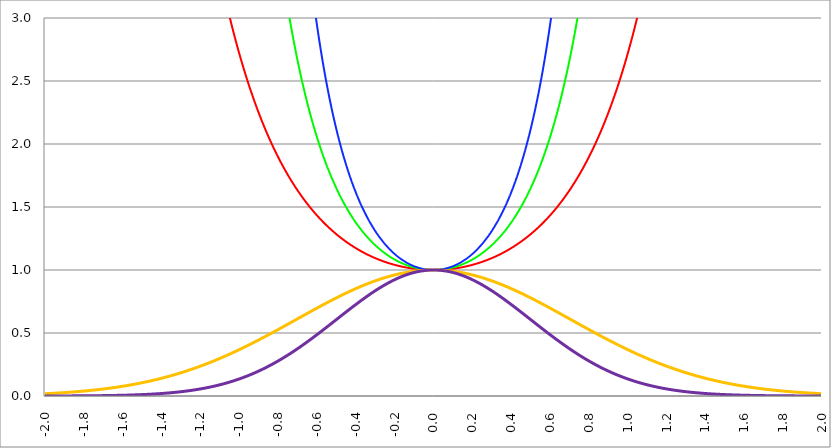
| Category | Series 1 | Series 0 | Series 2 | Series 3 | Series 4 |
|---|---|---|---|---|---|
| -2.0 | 54.598 | 2980.958 | 162754.791 | 0.018 | 0 |
| -1.998 | 54.163 | 2933.666 | 158897.084 | 0.018 | 0 |
| -1.996 | 53.732 | 2887.17 | 155134.537 | 0.019 | 0 |
| -1.994 | 53.305 | 2841.456 | 151464.719 | 0.019 | 0 |
| -1.992 | 52.882 | 2796.511 | 147885.263 | 0.019 | 0 |
| -1.99 | 52.463 | 2752.321 | 144393.862 | 0.019 | 0 |
| -1.988 | 52.047 | 2708.873 | 140988.274 | 0.019 | 0 |
| -1.986 | 51.635 | 2666.153 | 137666.311 | 0.019 | 0 |
| -1.984 | 51.226 | 2624.149 | 134425.847 | 0.02 | 0 |
| -1.982 | 50.822 | 2582.848 | 131264.808 | 0.02 | 0 |
| -1.98 | 50.421 | 2542.238 | 128181.179 | 0.02 | 0 |
| -1.978 | 50.023 | 2502.306 | 125172.993 | 0.02 | 0 |
| -1.976 | 49.629 | 2463.041 | 122238.337 | 0.02 | 0 |
| -1.974 | 49.239 | 2424.431 | 119375.349 | 0.02 | 0 |
| -1.972 | 48.851 | 2386.464 | 116582.214 | 0.02 | 0 |
| -1.97 | 48.468 | 2349.129 | 113857.165 | 0.021 | 0 |
| -1.968 | 48.088 | 2312.416 | 111198.481 | 0.021 | 0 |
| -1.966 | 47.711 | 2276.312 | 108604.487 | 0.021 | 0 |
| -1.964 | 47.337 | 2240.808 | 106073.55 | 0.021 | 0 |
| -1.962 | 46.967 | 2205.894 | 103604.081 | 0.021 | 0 |
| -1.96 | 46.6 | 2171.558 | 101194.532 | 0.021 | 0 |
| -1.958 | 46.236 | 2137.79 | 98843.394 | 0.022 | 0 |
| -1.956 | 45.876 | 2104.582 | 96549.2 | 0.022 | 0 |
| -1.954 | 45.518 | 2071.922 | 94310.518 | 0.022 | 0 |
| -1.952 | 45.164 | 2039.802 | 92125.955 | 0.022 | 0 |
| -1.95 | 44.813 | 2008.212 | 89994.155 | 0.022 | 0 |
| -1.948 | 44.465 | 1977.143 | 87913.794 | 0.022 | 0.001 |
| -1.946 | 44.12 | 1946.585 | 85883.585 | 0.023 | 0.001 |
| -1.944 | 43.778 | 1916.531 | 83902.274 | 0.023 | 0.001 |
| -1.942 | 43.439 | 1886.971 | 81968.639 | 0.023 | 0.001 |
| -1.94 | 43.103 | 1857.896 | 80081.488 | 0.023 | 0.001 |
| -1.938 | 42.77 | 1829.299 | 78239.663 | 0.023 | 0.001 |
| -1.936 | 42.44 | 1801.17 | 76442.033 | 0.024 | 0.001 |
| -1.934 | 42.113 | 1773.503 | 74687.498 | 0.024 | 0.001 |
| -1.932 | 41.789 | 1746.289 | 72974.986 | 0.024 | 0.001 |
| -1.93 | 41.467 | 1719.519 | 71303.451 | 0.024 | 0.001 |
| -1.928 | 41.148 | 1693.187 | 69671.875 | 0.024 | 0.001 |
| -1.926 | 40.832 | 1667.285 | 68079.267 | 0.024 | 0.001 |
| -1.924 | 40.519 | 1641.806 | 66524.661 | 0.025 | 0.001 |
| -1.922 | 40.209 | 1616.742 | 65007.115 | 0.025 | 0.001 |
| -1.92 | 39.901 | 1592.085 | 63525.711 | 0.025 | 0.001 |
| -1.918 | 39.596 | 1567.83 | 62079.556 | 0.025 | 0.001 |
| -1.916 | 39.293 | 1543.97 | 60667.778 | 0.025 | 0.001 |
| -1.914 | 38.994 | 1520.496 | 59289.529 | 0.026 | 0.001 |
| -1.912 | 38.696 | 1497.404 | 57943.982 | 0.026 | 0.001 |
| -1.91 | 38.402 | 1474.685 | 56630.331 | 0.026 | 0.001 |
| -1.908 | 38.11 | 1452.335 | 55347.789 | 0.026 | 0.001 |
| -1.906 | 37.82 | 1430.346 | 54095.593 | 0.026 | 0.001 |
| -1.904 | 37.533 | 1408.713 | 52872.995 | 0.027 | 0.001 |
| -1.902 | 37.248 | 1387.429 | 51679.269 | 0.027 | 0.001 |
| -1.9 | 36.966 | 1366.489 | 50513.707 | 0.027 | 0.001 |
| -1.898 | 36.686 | 1345.886 | 49375.617 | 0.027 | 0.001 |
| -1.896 | 36.409 | 1325.615 | 48264.327 | 0.027 | 0.001 |
| -1.894 | 36.134 | 1305.671 | 47179.181 | 0.028 | 0.001 |
| -1.892 | 35.861 | 1286.046 | 46119.54 | 0.028 | 0.001 |
| -1.89 | 35.591 | 1266.738 | 45084.78 | 0.028 | 0.001 |
| -1.888 | 35.323 | 1247.739 | 44074.294 | 0.028 | 0.001 |
| -1.886 | 35.058 | 1229.044 | 43087.491 | 0.029 | 0.001 |
| -1.884 | 34.794 | 1210.649 | 42123.792 | 0.029 | 0.001 |
| -1.882 | 34.533 | 1192.549 | 41182.636 | 0.029 | 0.001 |
| -1.88 | 34.274 | 1174.738 | 40263.475 | 0.029 | 0.001 |
| -1.878 | 34.018 | 1157.211 | 39365.773 | 0.029 | 0.001 |
| -1.876 | 33.763 | 1139.964 | 38489.009 | 0.03 | 0.001 |
| -1.874 | 33.511 | 1122.992 | 37632.676 | 0.03 | 0.001 |
| -1.872 | 33.261 | 1106.291 | 36796.279 | 0.03 | 0.001 |
| -1.87 | 33.013 | 1089.855 | 35979.334 | 0.03 | 0.001 |
| -1.868 | 32.767 | 1073.681 | 35181.371 | 0.031 | 0.001 |
| -1.866 | 32.523 | 1057.763 | 34401.932 | 0.031 | 0.001 |
| -1.864 | 32.282 | 1042.099 | 33640.568 | 0.031 | 0.001 |
| -1.862 | 32.042 | 1026.682 | 32896.844 | 0.031 | 0.001 |
| -1.86 | 31.804 | 1011.51 | 32170.334 | 0.031 | 0.001 |
| -1.858 | 31.569 | 996.579 | 31460.624 | 0.032 | 0.001 |
| -1.856 | 31.335 | 981.883 | 30767.309 | 0.032 | 0.001 |
| -1.854 | 31.103 | 967.419 | 30089.995 | 0.032 | 0.001 |
| -1.852 | 30.874 | 953.184 | 29428.298 | 0.032 | 0.001 |
| -1.85 | 30.646 | 939.173 | 28781.843 | 0.033 | 0.001 |
| -1.848 | 30.42 | 925.383 | 28150.264 | 0.033 | 0.001 |
| -1.846 | 30.196 | 911.81 | 27533.205 | 0.033 | 0.001 |
| -1.844 | 29.974 | 898.451 | 26930.318 | 0.033 | 0.001 |
| -1.842 | 29.754 | 885.301 | 26341.265 | 0.034 | 0.001 |
| -1.84 | 29.536 | 872.358 | 25765.715 | 0.034 | 0.001 |
| -1.838 | 29.319 | 859.618 | 25203.345 | 0.034 | 0.001 |
| -1.836 | 29.105 | 847.077 | 24653.841 | 0.034 | 0.001 |
| -1.834 | 28.892 | 834.733 | 24116.897 | 0.035 | 0.001 |
| -1.832 | 28.681 | 822.582 | 23592.213 | 0.035 | 0.001 |
| -1.83 | 28.471 | 810.62 | 23079.499 | 0.035 | 0.001 |
| -1.828 | 28.264 | 798.846 | 22578.468 | 0.035 | 0.001 |
| -1.826 | 28.058 | 787.255 | 22088.845 | 0.036 | 0.001 |
| -1.824 | 27.854 | 775.844 | 21610.358 | 0.036 | 0.001 |
| -1.822 | 27.652 | 764.612 | 21142.743 | 0.036 | 0.001 |
| -1.82 | 27.451 | 753.553 | 20685.743 | 0.036 | 0.001 |
| -1.818 | 27.252 | 742.667 | 20239.107 | 0.037 | 0.001 |
| -1.816 | 27.055 | 731.95 | 19802.59 | 0.037 | 0.001 |
| -1.814 | 26.859 | 721.399 | 19375.952 | 0.037 | 0.001 |
| -1.812 | 26.665 | 711.011 | 18958.961 | 0.038 | 0.001 |
| -1.81 | 26.472 | 700.784 | 18551.39 | 0.038 | 0.001 |
| -1.808 | 26.281 | 690.715 | 18153.016 | 0.038 | 0.001 |
| -1.806 | 26.092 | 680.802 | 17763.623 | 0.038 | 0.001 |
| -1.804 | 25.904 | 671.042 | 17383 | 0.039 | 0.001 |
| -1.802 | 25.718 | 661.433 | 17010.941 | 0.039 | 0.002 |
| -1.8 | 25.534 | 651.971 | 16647.245 | 0.039 | 0.002 |
| -1.798 | 25.351 | 642.655 | 16291.715 | 0.039 | 0.002 |
| -1.796 | 25.169 | 633.482 | 15944.162 | 0.04 | 0.002 |
| -1.794 | 24.989 | 624.45 | 15604.397 | 0.04 | 0.002 |
| -1.792 | 24.81 | 615.557 | 15272.239 | 0.04 | 0.002 |
| -1.79 | 24.633 | 606.8 | 14947.51 | 0.041 | 0.002 |
| -1.788 | 24.458 | 598.178 | 14630.037 | 0.041 | 0.002 |
| -1.786 | 24.283 | 589.687 | 14319.65 | 0.041 | 0.002 |
| -1.784 | 24.111 | 581.326 | 14016.185 | 0.041 | 0.002 |
| -1.782 | 23.939 | 573.093 | 13719.48 | 0.042 | 0.002 |
| -1.78 | 23.769 | 564.985 | 13429.378 | 0.042 | 0.002 |
| -1.778 | 23.601 | 557.002 | 13145.726 | 0.042 | 0.002 |
| -1.776 | 23.434 | 549.139 | 12868.375 | 0.043 | 0.002 |
| -1.774 | 23.268 | 541.397 | 12597.177 | 0.043 | 0.002 |
| -1.772 | 23.103 | 533.772 | 12331.99 | 0.043 | 0.002 |
| -1.77 | 22.94 | 526.262 | 12072.676 | 0.044 | 0.002 |
| -1.768 | 22.779 | 518.867 | 11819.098 | 0.044 | 0.002 |
| -1.766 | 22.618 | 511.584 | 11571.124 | 0.044 | 0.002 |
| -1.764 | 22.459 | 504.411 | 11328.625 | 0.045 | 0.002 |
| -1.762 | 22.301 | 497.347 | 11091.474 | 0.045 | 0.002 |
| -1.76 | 22.145 | 490.39 | 10859.548 | 0.045 | 0.002 |
| -1.758 | 21.989 | 483.537 | 10632.727 | 0.045 | 0.002 |
| -1.756 | 21.835 | 476.788 | 10410.894 | 0.046 | 0.002 |
| -1.754 | 21.683 | 470.141 | 10193.933 | 0.046 | 0.002 |
| -1.752 | 21.531 | 463.593 | 9981.733 | 0.046 | 0.002 |
| -1.75 | 21.381 | 457.145 | 9774.185 | 0.047 | 0.002 |
| -1.748 | 21.232 | 450.793 | 9571.182 | 0.047 | 0.002 |
| -1.746 | 21.084 | 444.536 | 9372.62 | 0.047 | 0.002 |
| -1.744 | 20.937 | 438.374 | 9178.398 | 0.048 | 0.002 |
| -1.742 | 20.792 | 432.304 | 8988.417 | 0.048 | 0.002 |
| -1.74 | 20.648 | 426.324 | 8802.579 | 0.048 | 0.002 |
| -1.738 | 20.504 | 420.434 | 8620.79 | 0.049 | 0.002 |
| -1.736 | 20.363 | 414.632 | 8442.958 | 0.049 | 0.002 |
| -1.734 | 20.222 | 408.917 | 8268.993 | 0.049 | 0.002 |
| -1.732 | 20.082 | 403.287 | 8098.807 | 0.05 | 0.002 |
| -1.73 | 19.943 | 397.741 | 7932.313 | 0.05 | 0.003 |
| -1.728 | 19.806 | 392.277 | 7769.429 | 0.05 | 0.003 |
| -1.726 | 19.67 | 386.894 | 7610.073 | 0.051 | 0.003 |
| -1.724 | 19.534 | 381.592 | 7454.163 | 0.051 | 0.003 |
| -1.722 | 19.4 | 376.368 | 7301.624 | 0.052 | 0.003 |
| -1.72 | 19.267 | 371.222 | 7152.377 | 0.052 | 0.003 |
| -1.718 | 19.135 | 366.152 | 7006.349 | 0.052 | 0.003 |
| -1.716 | 19.004 | 361.157 | 6863.467 | 0.053 | 0.003 |
| -1.714 | 18.874 | 356.235 | 6723.66 | 0.053 | 0.003 |
| -1.712 | 18.745 | 351.387 | 6586.86 | 0.053 | 0.003 |
| -1.71 | 18.617 | 346.61 | 6452.997 | 0.054 | 0.003 |
| -1.708 | 18.491 | 341.903 | 6322.007 | 0.054 | 0.003 |
| -1.706 | 18.365 | 337.266 | 6193.824 | 0.054 | 0.003 |
| -1.704 | 18.24 | 332.697 | 6068.386 | 0.055 | 0.003 |
| -1.702 | 18.116 | 328.195 | 5945.631 | 0.055 | 0.003 |
| -1.7 | 17.993 | 323.759 | 5825.499 | 0.056 | 0.003 |
| -1.698 | 17.871 | 319.388 | 5707.932 | 0.056 | 0.003 |
| -1.696 | 17.751 | 315.082 | 5592.871 | 0.056 | 0.003 |
| -1.694 | 17.631 | 310.838 | 5480.261 | 0.057 | 0.003 |
| -1.692 | 17.512 | 306.656 | 5370.047 | 0.057 | 0.003 |
| -1.69 | 17.394 | 302.536 | 5262.176 | 0.057 | 0.003 |
| -1.688 | 17.276 | 298.476 | 5156.596 | 0.058 | 0.003 |
| -1.686 | 17.16 | 294.474 | 5053.256 | 0.058 | 0.003 |
| -1.684 | 17.045 | 290.531 | 4952.105 | 0.059 | 0.003 |
| -1.682 | 16.931 | 286.646 | 4853.095 | 0.059 | 0.003 |
| -1.68 | 16.817 | 282.817 | 4756.18 | 0.059 | 0.004 |
| -1.678 | 16.705 | 279.044 | 4661.311 | 0.06 | 0.004 |
| -1.676 | 16.593 | 275.325 | 4568.444 | 0.06 | 0.004 |
| -1.674 | 16.482 | 271.66 | 4477.535 | 0.061 | 0.004 |
| -1.672 | 16.372 | 268.049 | 4388.541 | 0.061 | 0.004 |
| -1.67 | 16.263 | 264.489 | 4301.418 | 0.061 | 0.004 |
| -1.668 | 16.155 | 260.981 | 4216.126 | 0.062 | 0.004 |
| -1.666 | 16.048 | 257.524 | 4132.625 | 0.062 | 0.004 |
| -1.664 | 15.941 | 254.116 | 4050.874 | 0.063 | 0.004 |
| -1.662 | 15.835 | 250.758 | 3970.836 | 0.063 | 0.004 |
| -1.66 | 15.73 | 247.448 | 3892.473 | 0.064 | 0.004 |
| -1.658 | 15.626 | 244.185 | 3815.748 | 0.064 | 0.004 |
| -1.656 | 15.523 | 240.97 | 3740.625 | 0.064 | 0.004 |
| -1.654 | 15.421 | 237.8 | 3667.069 | 0.065 | 0.004 |
| -1.652 | 15.319 | 234.677 | 3595.046 | 0.065 | 0.004 |
| -1.65 | 15.218 | 231.597 | 3524.522 | 0.066 | 0.004 |
| -1.648 | 15.118 | 228.562 | 3455.464 | 0.066 | 0.004 |
| -1.646 | 15.019 | 225.57 | 3387.841 | 0.067 | 0.004 |
| -1.644 | 14.92 | 222.621 | 3321.62 | 0.067 | 0.004 |
| -1.642 | 14.823 | 219.714 | 3256.773 | 0.067 | 0.005 |
| -1.64 | 14.726 | 216.849 | 3193.268 | 0.068 | 0.005 |
| -1.638 | 14.63 | 214.024 | 3131.076 | 0.068 | 0.005 |
| -1.636 | 14.534 | 211.239 | 3070.169 | 0.069 | 0.005 |
| -1.634 | 14.439 | 208.494 | 3010.52 | 0.069 | 0.005 |
| -1.632 | 14.345 | 205.788 | 2952.1 | 0.07 | 0.005 |
| -1.63 | 14.252 | 203.121 | 2894.883 | 0.07 | 0.005 |
| -1.628 | 14.159 | 200.491 | 2838.843 | 0.071 | 0.005 |
| -1.626 | 14.068 | 197.898 | 2783.955 | 0.071 | 0.005 |
| -1.624 | 13.976 | 195.342 | 2730.194 | 0.072 | 0.005 |
| -1.622 | 13.886 | 192.822 | 2677.535 | 0.072 | 0.005 |
| -1.62 | 13.796 | 190.338 | 2625.955 | 0.072 | 0.005 |
| -1.618 | 13.707 | 187.888 | 2575.431 | 0.073 | 0.005 |
| -1.616 | 13.619 | 185.473 | 2525.939 | 0.073 | 0.005 |
| -1.614 | 13.531 | 183.093 | 2477.457 | 0.074 | 0.005 |
| -1.612 | 13.444 | 180.745 | 2429.965 | 0.074 | 0.006 |
| -1.61 | 13.358 | 178.431 | 2383.44 | 0.075 | 0.006 |
| -1.608 | 13.272 | 176.149 | 2337.862 | 0.075 | 0.006 |
| -1.606 | 13.187 | 173.899 | 2293.21 | 0.076 | 0.006 |
| -1.604 | 13.103 | 171.68 | 2249.466 | 0.076 | 0.006 |
| -1.602 | 13.019 | 169.492 | 2206.608 | 0.077 | 0.006 |
| -1.6 | 12.936 | 167.335 | 2164.62 | 0.077 | 0.006 |
| -1.598 | 12.853 | 165.208 | 2123.481 | 0.078 | 0.006 |
| -1.596 | 12.771 | 163.111 | 2083.174 | 0.078 | 0.006 |
| -1.594 | 12.69 | 161.043 | 2043.681 | 0.079 | 0.006 |
| -1.592 | 12.61 | 159.004 | 2004.985 | 0.079 | 0.006 |
| -1.59 | 12.53 | 156.993 | 1967.069 | 0.08 | 0.006 |
| -1.588 | 12.45 | 155.01 | 1929.916 | 0.08 | 0.006 |
| -1.586 | 12.372 | 153.054 | 1893.511 | 0.081 | 0.007 |
| -1.584 | 12.293 | 151.126 | 1857.837 | 0.081 | 0.007 |
| -1.582 | 12.216 | 149.224 | 1822.878 | 0.082 | 0.007 |
| -1.58 | 12.139 | 147.348 | 1788.621 | 0.082 | 0.007 |
| -1.578 | 12.062 | 145.499 | 1755.049 | 0.083 | 0.007 |
| -1.576 | 11.986 | 143.675 | 1722.149 | 0.083 | 0.007 |
| -1.574 | 11.911 | 141.876 | 1689.906 | 0.084 | 0.007 |
| -1.572 | 11.836 | 140.102 | 1658.306 | 0.084 | 0.007 |
| -1.57 | 11.762 | 138.352 | 1627.337 | 0.085 | 0.007 |
| -1.568 | 11.689 | 136.626 | 1596.984 | 0.086 | 0.007 |
| -1.566 | 11.616 | 134.924 | 1567.235 | 0.086 | 0.007 |
| -1.564 | 11.543 | 133.245 | 1538.077 | 0.087 | 0.008 |
| -1.562 | 11.471 | 131.59 | 1509.497 | 0.087 | 0.008 |
| -1.56 | 11.4 | 129.957 | 1481.485 | 0.088 | 0.008 |
| -1.558 | 11.329 | 128.346 | 1454.027 | 0.088 | 0.008 |
| -1.556 | 11.259 | 126.757 | 1427.112 | 0.089 | 0.008 |
| -1.554 | 11.189 | 125.19 | 1400.729 | 0.089 | 0.008 |
| -1.552 | 11.12 | 123.644 | 1374.867 | 0.09 | 0.008 |
| -1.55 | 11.051 | 122.119 | 1349.514 | 0.09 | 0.008 |
| -1.548 | 10.983 | 120.616 | 1324.661 | 0.091 | 0.008 |
| -1.546 | 10.915 | 119.132 | 1300.297 | 0.092 | 0.008 |
| -1.544 | 10.848 | 117.669 | 1276.412 | 0.092 | 0.008 |
| -1.542 | 10.781 | 116.225 | 1252.995 | 0.093 | 0.009 |
| -1.54 | 10.715 | 114.801 | 1230.038 | 0.093 | 0.009 |
| -1.538 | 10.649 | 113.396 | 1207.53 | 0.094 | 0.009 |
| -1.536 | 10.583 | 112.01 | 1185.462 | 0.094 | 0.009 |
| -1.534 | 10.519 | 110.643 | 1163.826 | 0.095 | 0.009 |
| -1.532 | 10.454 | 109.295 | 1142.612 | 0.096 | 0.009 |
| -1.53 | 10.391 | 107.964 | 1121.811 | 0.096 | 0.009 |
| -1.528 | 10.327 | 106.652 | 1101.416 | 0.097 | 0.009 |
| -1.526 | 10.264 | 105.357 | 1081.418 | 0.097 | 0.009 |
| -1.524 | 10.202 | 104.079 | 1061.808 | 0.098 | 0.01 |
| -1.522 | 10.14 | 102.819 | 1042.578 | 0.099 | 0.01 |
| -1.52 | 10.078 | 101.575 | 1023.722 | 0.099 | 0.01 |
| -1.518 | 10.017 | 100.348 | 1005.23 | 0.1 | 0.01 |
| -1.516 | 9.957 | 99.138 | 987.097 | 0.1 | 0.01 |
| -1.514 | 9.897 | 97.944 | 969.313 | 0.101 | 0.01 |
| -1.512 | 9.837 | 96.765 | 951.873 | 0.102 | 0.01 |
| -1.51 | 9.778 | 95.603 | 934.77 | 0.102 | 0.01 |
| -1.508 | 9.719 | 94.455 | 917.995 | 0.103 | 0.011 |
| -1.506 | 9.66 | 93.324 | 901.543 | 0.104 | 0.011 |
| -1.504 | 9.602 | 92.207 | 885.408 | 0.104 | 0.011 |
| -1.502 | 9.545 | 91.105 | 869.581 | 0.105 | 0.011 |
| -1.5 | 9.488 | 90.017 | 854.059 | 0.105 | 0.011 |
| -1.498 | 9.431 | 88.944 | 838.833 | 0.106 | 0.011 |
| -1.496 | 9.375 | 87.885 | 823.899 | 0.107 | 0.011 |
| -1.494 | 9.319 | 86.84 | 809.25 | 0.107 | 0.012 |
| -1.492 | 9.263 | 85.809 | 794.881 | 0.108 | 0.012 |
| -1.49 | 9.208 | 84.792 | 780.785 | 0.109 | 0.012 |
| -1.488 | 9.154 | 83.788 | 766.958 | 0.109 | 0.012 |
| -1.486 | 9.099 | 82.797 | 753.394 | 0.11 | 0.012 |
| -1.484 | 9.045 | 81.819 | 740.087 | 0.111 | 0.012 |
| -1.482 | 8.992 | 80.854 | 727.033 | 0.111 | 0.012 |
| -1.48 | 8.939 | 79.902 | 714.226 | 0.112 | 0.013 |
| -1.478 | 8.886 | 78.962 | 701.662 | 0.113 | 0.013 |
| -1.476 | 8.834 | 78.035 | 689.335 | 0.113 | 0.013 |
| -1.474 | 8.782 | 77.119 | 677.242 | 0.114 | 0.013 |
| -1.472 | 8.73 | 76.216 | 665.376 | 0.115 | 0.013 |
| -1.469999999999999 | 8.679 | 75.324 | 653.734 | 0.115 | 0.013 |
| -1.467999999999999 | 8.628 | 74.444 | 642.311 | 0.116 | 0.013 |
| -1.465999999999999 | 8.578 | 73.575 | 631.102 | 0.117 | 0.014 |
| -1.463999999999999 | 8.527 | 72.718 | 620.104 | 0.117 | 0.014 |
| -1.461999999999999 | 8.478 | 71.872 | 609.313 | 0.118 | 0.014 |
| -1.459999999999999 | 8.428 | 71.037 | 598.724 | 0.119 | 0.014 |
| -1.457999999999999 | 8.379 | 70.213 | 588.332 | 0.119 | 0.014 |
| -1.455999999999999 | 8.331 | 69.399 | 578.135 | 0.12 | 0.014 |
| -1.453999999999999 | 8.282 | 68.596 | 568.129 | 0.121 | 0.015 |
| -1.451999999999999 | 8.234 | 67.803 | 558.309 | 0.121 | 0.015 |
| -1.449999999999999 | 8.187 | 67.021 | 548.672 | 0.122 | 0.015 |
| -1.447999999999999 | 8.139 | 66.248 | 539.214 | 0.123 | 0.015 |
| -1.445999999999999 | 8.092 | 65.486 | 529.932 | 0.124 | 0.015 |
| -1.443999999999999 | 8.046 | 64.733 | 520.822 | 0.124 | 0.015 |
| -1.441999999999999 | 7.999 | 63.99 | 511.881 | 0.125 | 0.016 |
| -1.439999999999999 | 7.953 | 63.257 | 503.106 | 0.126 | 0.016 |
| -1.437999999999999 | 7.908 | 62.533 | 494.493 | 0.126 | 0.016 |
| -1.435999999999999 | 7.862 | 61.818 | 486.039 | 0.127 | 0.016 |
| -1.433999999999999 | 7.817 | 61.112 | 477.741 | 0.128 | 0.016 |
| -1.431999999999999 | 7.773 | 60.416 | 469.596 | 0.129 | 0.017 |
| -1.429999999999999 | 7.728 | 59.728 | 461.601 | 0.129 | 0.017 |
| -1.427999999999999 | 7.684 | 59.049 | 453.753 | 0.13 | 0.017 |
| -1.425999999999999 | 7.641 | 58.379 | 446.049 | 0.131 | 0.017 |
| -1.423999999999999 | 7.597 | 57.717 | 438.486 | 0.132 | 0.017 |
| -1.421999999999999 | 7.554 | 57.064 | 431.062 | 0.132 | 0.018 |
| -1.419999999999999 | 7.511 | 56.419 | 423.774 | 0.133 | 0.018 |
| -1.417999999999999 | 7.469 | 55.782 | 416.619 | 0.134 | 0.018 |
| -1.415999999999999 | 7.427 | 55.153 | 409.595 | 0.135 | 0.018 |
| -1.413999999999999 | 7.385 | 54.532 | 402.698 | 0.135 | 0.018 |
| -1.411999999999999 | 7.343 | 53.919 | 395.928 | 0.136 | 0.019 |
| -1.409999999999999 | 7.302 | 53.314 | 389.28 | 0.137 | 0.019 |
| -1.407999999999999 | 7.261 | 52.716 | 382.754 | 0.138 | 0.019 |
| -1.405999999999999 | 7.22 | 52.126 | 376.346 | 0.139 | 0.019 |
| -1.403999999999999 | 7.179 | 51.544 | 370.054 | 0.139 | 0.019 |
| -1.401999999999999 | 7.139 | 50.969 | 363.876 | 0.14 | 0.02 |
| -1.399999999999999 | 7.099 | 50.4 | 357.809 | 0.141 | 0.02 |
| -1.397999999999999 | 7.06 | 49.84 | 351.852 | 0.142 | 0.02 |
| -1.395999999999999 | 7.02 | 49.286 | 346.003 | 0.142 | 0.02 |
| -1.393999999999999 | 6.981 | 48.739 | 340.259 | 0.143 | 0.021 |
| -1.391999999999999 | 6.943 | 48.199 | 334.619 | 0.144 | 0.021 |
| -1.389999999999999 | 6.904 | 47.665 | 329.08 | 0.145 | 0.021 |
| -1.387999999999999 | 6.866 | 47.138 | 323.64 | 0.146 | 0.021 |
| -1.385999999999999 | 6.828 | 46.618 | 318.298 | 0.146 | 0.021 |
| -1.383999999999999 | 6.79 | 46.105 | 313.052 | 0.147 | 0.022 |
| -1.381999999999999 | 6.753 | 45.597 | 307.899 | 0.148 | 0.022 |
| -1.379999999999999 | 6.715 | 45.096 | 302.839 | 0.149 | 0.022 |
| -1.377999999999999 | 6.678 | 44.602 | 297.868 | 0.15 | 0.022 |
| -1.375999999999999 | 6.642 | 44.113 | 292.987 | 0.151 | 0.023 |
| -1.373999999999999 | 6.605 | 43.63 | 288.192 | 0.151 | 0.023 |
| -1.371999999999999 | 6.569 | 43.154 | 283.483 | 0.152 | 0.023 |
| -1.369999999999999 | 6.533 | 42.683 | 278.857 | 0.153 | 0.023 |
| -1.367999999999999 | 6.498 | 42.218 | 274.314 | 0.154 | 0.024 |
| -1.365999999999999 | 6.462 | 41.759 | 269.85 | 0.155 | 0.024 |
| -1.363999999999999 | 6.427 | 41.305 | 265.466 | 0.156 | 0.024 |
| -1.361999999999999 | 6.392 | 40.857 | 261.16 | 0.156 | 0.024 |
| -1.359999999999999 | 6.357 | 40.415 | 256.929 | 0.157 | 0.025 |
| -1.357999999999999 | 6.323 | 39.978 | 252.773 | 0.158 | 0.025 |
| -1.355999999999999 | 6.289 | 39.546 | 248.69 | 0.159 | 0.025 |
| -1.353999999999999 | 6.255 | 39.12 | 244.679 | 0.16 | 0.026 |
| -1.351999999999999 | 6.221 | 38.699 | 240.739 | 0.161 | 0.026 |
| -1.349999999999999 | 6.187 | 38.283 | 236.867 | 0.162 | 0.026 |
| -1.347999999999999 | 6.154 | 37.872 | 233.064 | 0.162 | 0.026 |
| -1.345999999999999 | 6.121 | 37.466 | 229.327 | 0.163 | 0.027 |
| -1.343999999999999 | 6.088 | 37.065 | 225.655 | 0.164 | 0.027 |
| -1.341999999999999 | 6.055 | 36.669 | 222.048 | 0.165 | 0.027 |
| -1.339999999999999 | 6.023 | 36.278 | 218.503 | 0.166 | 0.028 |
| -1.337999999999999 | 5.991 | 35.891 | 215.02 | 0.167 | 0.028 |
| -1.335999999999999 | 5.959 | 35.509 | 211.598 | 0.168 | 0.028 |
| -1.333999999999999 | 5.927 | 35.132 | 208.235 | 0.169 | 0.028 |
| -1.331999999999999 | 5.896 | 34.759 | 204.931 | 0.17 | 0.029 |
| -1.329999999999999 | 5.864 | 34.391 | 201.684 | 0.171 | 0.029 |
| -1.327999999999999 | 5.833 | 34.027 | 198.493 | 0.171 | 0.029 |
| -1.325999999999999 | 5.802 | 33.668 | 195.357 | 0.172 | 0.03 |
| -1.323999999999999 | 5.772 | 33.313 | 192.275 | 0.173 | 0.03 |
| -1.321999999999999 | 5.741 | 32.962 | 189.247 | 0.174 | 0.03 |
| -1.319999999999999 | 5.711 | 32.616 | 186.271 | 0.175 | 0.031 |
| -1.317999999999999 | 5.681 | 32.274 | 183.345 | 0.176 | 0.031 |
| -1.315999999999999 | 5.651 | 31.935 | 180.471 | 0.177 | 0.031 |
| -1.313999999999999 | 5.621 | 31.601 | 177.645 | 0.178 | 0.032 |
| -1.311999999999999 | 5.592 | 31.271 | 174.868 | 0.179 | 0.032 |
| -1.309999999999999 | 5.563 | 30.945 | 172.139 | 0.18 | 0.032 |
| -1.307999999999999 | 5.534 | 30.622 | 169.456 | 0.181 | 0.033 |
| -1.305999999999999 | 5.505 | 30.304 | 166.819 | 0.182 | 0.033 |
| -1.303999999999999 | 5.476 | 29.989 | 164.227 | 0.183 | 0.033 |
| -1.301999999999999 | 5.448 | 29.678 | 161.679 | 0.184 | 0.034 |
| -1.299999999999999 | 5.419 | 29.371 | 159.174 | 0.185 | 0.034 |
| -1.297999999999999 | 5.391 | 29.067 | 156.712 | 0.185 | 0.034 |
| -1.295999999999999 | 5.363 | 28.767 | 154.292 | 0.186 | 0.035 |
| -1.293999999999999 | 5.336 | 28.471 | 151.913 | 0.187 | 0.035 |
| -1.291999999999999 | 5.308 | 28.178 | 149.574 | 0.188 | 0.035 |
| -1.289999999999999 | 5.281 | 27.888 | 147.275 | 0.189 | 0.036 |
| -1.287999999999999 | 5.254 | 27.602 | 145.014 | 0.19 | 0.036 |
| -1.285999999999999 | 5.227 | 27.319 | 142.792 | 0.191 | 0.037 |
| -1.283999999999999 | 5.2 | 27.04 | 140.607 | 0.192 | 0.037 |
| -1.281999999999999 | 5.173 | 26.764 | 138.459 | 0.193 | 0.037 |
| -1.279999999999999 | 5.147 | 26.491 | 136.347 | 0.194 | 0.038 |
| -1.277999999999999 | 5.121 | 26.221 | 134.27 | 0.195 | 0.038 |
| -1.275999999999999 | 5.095 | 25.955 | 132.228 | 0.196 | 0.039 |
| -1.273999999999999 | 5.069 | 25.691 | 130.22 | 0.197 | 0.039 |
| -1.271999999999999 | 5.043 | 25.431 | 128.246 | 0.198 | 0.039 |
| -1.269999999999999 | 5.017 | 25.174 | 126.305 | 0.199 | 0.04 |
| -1.267999999999999 | 4.992 | 24.919 | 124.396 | 0.2 | 0.04 |
| -1.265999999999999 | 4.967 | 24.668 | 122.519 | 0.201 | 0.041 |
| -1.263999999999999 | 4.942 | 24.42 | 120.673 | 0.202 | 0.041 |
| -1.261999999999999 | 4.917 | 24.174 | 118.858 | 0.203 | 0.041 |
| -1.259999999999999 | 4.892 | 23.932 | 117.073 | 0.204 | 0.042 |
| -1.257999999999999 | 4.867 | 23.692 | 115.318 | 0.205 | 0.042 |
| -1.255999999999999 | 4.843 | 23.455 | 113.591 | 0.206 | 0.043 |
| -1.253999999999999 | 4.819 | 23.22 | 111.894 | 0.208 | 0.043 |
| -1.251999999999999 | 4.795 | 22.989 | 110.224 | 0.209 | 0.043 |
| -1.249999999999999 | 4.771 | 22.76 | 108.581 | 0.21 | 0.044 |
| -1.247999999999999 | 4.747 | 22.534 | 106.966 | 0.211 | 0.044 |
| -1.245999999999999 | 4.723 | 22.31 | 105.377 | 0.212 | 0.045 |
| -1.243999999999999 | 4.7 | 22.089 | 103.815 | 0.213 | 0.045 |
| -1.241999999999999 | 4.677 | 21.87 | 102.278 | 0.214 | 0.046 |
| -1.239999999999999 | 4.653 | 21.654 | 100.766 | 0.215 | 0.046 |
| -1.237999999999999 | 4.63 | 21.441 | 99.279 | 0.216 | 0.047 |
| -1.235999999999999 | 4.608 | 21.23 | 97.816 | 0.217 | 0.047 |
| -1.233999999999999 | 4.585 | 21.021 | 96.377 | 0.218 | 0.048 |
| -1.231999999999999 | 4.562 | 20.814 | 94.962 | 0.219 | 0.048 |
| -1.229999999999999 | 4.54 | 20.61 | 93.569 | 0.22 | 0.049 |
| -1.227999999999999 | 4.518 | 20.409 | 92.199 | 0.221 | 0.049 |
| -1.225999999999999 | 4.495 | 20.209 | 90.852 | 0.222 | 0.049 |
| -1.223999999999999 | 4.474 | 20.012 | 89.526 | 0.224 | 0.05 |
| -1.221999999999999 | 4.452 | 19.818 | 88.222 | 0.225 | 0.05 |
| -1.219999999999999 | 4.43 | 19.625 | 86.938 | 0.226 | 0.051 |
| -1.217999999999999 | 4.408 | 19.434 | 85.676 | 0.227 | 0.051 |
| -1.215999999999999 | 4.387 | 19.246 | 84.434 | 0.228 | 0.052 |
| -1.213999999999999 | 4.366 | 19.06 | 83.212 | 0.229 | 0.052 |
| -1.211999999999999 | 4.345 | 18.876 | 82.009 | 0.23 | 0.053 |
| -1.209999999999999 | 4.324 | 18.694 | 80.826 | 0.231 | 0.053 |
| -1.207999999999999 | 4.303 | 18.514 | 79.662 | 0.232 | 0.054 |
| -1.205999999999999 | 4.282 | 18.336 | 78.516 | 0.234 | 0.055 |
| -1.203999999999999 | 4.261 | 18.16 | 77.389 | 0.235 | 0.055 |
| -1.201999999999999 | 4.241 | 17.986 | 76.28 | 0.236 | 0.056 |
| -1.199999999999999 | 4.221 | 17.814 | 75.189 | 0.237 | 0.056 |
| -1.197999999999999 | 4.201 | 17.644 | 74.115 | 0.238 | 0.057 |
| -1.195999999999999 | 4.18 | 17.476 | 73.058 | 0.239 | 0.057 |
| -1.193999999999999 | 4.161 | 17.31 | 72.017 | 0.24 | 0.058 |
| -1.191999999999999 | 4.141 | 17.145 | 70.994 | 0.242 | 0.058 |
| -1.189999999999999 | 4.121 | 16.983 | 69.986 | 0.243 | 0.059 |
| -1.187999999999999 | 4.101 | 16.822 | 68.995 | 0.244 | 0.059 |
| -1.185999999999999 | 4.082 | 16.663 | 68.019 | 0.245 | 0.06 |
| -1.183999999999999 | 4.063 | 16.506 | 67.059 | 0.246 | 0.061 |
| -1.181999999999999 | 4.044 | 16.35 | 66.113 | 0.247 | 0.061 |
| -1.179999999999999 | 4.024 | 16.197 | 65.183 | 0.248 | 0.062 |
| -1.177999999999999 | 4.006 | 16.045 | 64.267 | 0.25 | 0.062 |
| -1.175999999999999 | 3.987 | 15.894 | 63.366 | 0.251 | 0.063 |
| -1.173999999999999 | 3.968 | 15.745 | 62.479 | 0.252 | 0.064 |
| -1.171999999999999 | 3.949 | 15.598 | 61.606 | 0.253 | 0.064 |
| -1.169999999999999 | 3.931 | 15.453 | 60.746 | 0.254 | 0.065 |
| -1.167999999999999 | 3.913 | 15.309 | 59.9 | 0.256 | 0.065 |
| -1.165999999999999 | 3.894 | 15.167 | 59.067 | 0.257 | 0.066 |
| -1.163999999999999 | 3.876 | 15.026 | 58.247 | 0.258 | 0.067 |
| -1.161999999999999 | 3.858 | 14.887 | 57.439 | 0.259 | 0.067 |
| -1.159999999999999 | 3.84 | 14.749 | 56.645 | 0.26 | 0.068 |
| -1.157999999999999 | 3.823 | 14.613 | 55.862 | 0.262 | 0.068 |
| -1.155999999999999 | 3.805 | 14.479 | 55.092 | 0.263 | 0.069 |
| -1.153999999999999 | 3.788 | 14.345 | 54.334 | 0.264 | 0.07 |
| -1.151999999999999 | 3.77 | 14.214 | 53.587 | 0.265 | 0.07 |
| -1.149999999999999 | 3.753 | 14.083 | 52.852 | 0.266 | 0.071 |
| -1.147999999999999 | 3.736 | 13.955 | 52.129 | 0.268 | 0.072 |
| -1.145999999999999 | 3.718 | 13.827 | 51.416 | 0.269 | 0.072 |
| -1.143999999999999 | 3.701 | 13.701 | 50.714 | 0.27 | 0.073 |
| -1.141999999999999 | 3.685 | 13.576 | 50.023 | 0.271 | 0.074 |
| -1.139999999999999 | 3.668 | 13.453 | 49.343 | 0.273 | 0.074 |
| -1.137999999999999 | 3.651 | 13.331 | 48.673 | 0.274 | 0.075 |
| -1.135999999999999 | 3.635 | 13.21 | 48.014 | 0.275 | 0.076 |
| -1.133999999999999 | 3.618 | 13.091 | 47.364 | 0.276 | 0.076 |
| -1.131999999999999 | 3.602 | 12.973 | 46.725 | 0.278 | 0.077 |
| -1.129999999999999 | 3.586 | 12.856 | 46.095 | 0.279 | 0.078 |
| -1.127999999999999 | 3.569 | 12.74 | 45.475 | 0.28 | 0.078 |
| -1.125999999999999 | 3.553 | 12.626 | 44.864 | 0.281 | 0.079 |
| -1.123999999999999 | 3.537 | 12.513 | 44.262 | 0.283 | 0.08 |
| -1.121999999999999 | 3.521 | 12.401 | 43.67 | 0.284 | 0.081 |
| -1.119999999999999 | 3.506 | 12.29 | 43.086 | 0.285 | 0.081 |
| -1.117999999999999 | 3.49 | 12.181 | 42.511 | 0.287 | 0.082 |
| -1.115999999999999 | 3.475 | 12.072 | 41.945 | 0.288 | 0.083 |
| -1.113999999999999 | 3.459 | 11.965 | 41.388 | 0.289 | 0.084 |
| -1.111999999999999 | 3.444 | 11.859 | 40.839 | 0.29 | 0.084 |
| -1.109999999999999 | 3.428 | 11.754 | 40.298 | 0.292 | 0.085 |
| -1.107999999999999 | 3.413 | 11.65 | 39.765 | 0.293 | 0.086 |
| -1.105999999999999 | 3.398 | 11.548 | 39.24 | 0.294 | 0.087 |
| -1.103999999999999 | 3.383 | 11.446 | 38.724 | 0.296 | 0.087 |
| -1.101999999999999 | 3.368 | 11.345 | 38.214 | 0.297 | 0.088 |
| -1.099999999999999 | 3.353 | 11.246 | 37.713 | 0.298 | 0.089 |
| -1.097999999999999 | 3.339 | 11.147 | 37.219 | 0.3 | 0.09 |
| -1.095999999999999 | 3.324 | 11.05 | 36.732 | 0.301 | 0.09 |
| -1.093999999999999 | 3.31 | 10.954 | 36.252 | 0.302 | 0.091 |
| -1.091999999999999 | 3.295 | 10.858 | 35.78 | 0.303 | 0.092 |
| -1.089999999999999 | 3.281 | 10.764 | 35.315 | 0.305 | 0.093 |
| -1.087999999999999 | 3.267 | 10.671 | 34.856 | 0.306 | 0.094 |
| -1.085999999999999 | 3.252 | 10.578 | 34.405 | 0.307 | 0.095 |
| -1.083999999999999 | 3.238 | 10.487 | 33.959 | 0.309 | 0.095 |
| -1.081999999999999 | 3.224 | 10.396 | 33.521 | 0.31 | 0.096 |
| -1.079999999999999 | 3.21 | 10.307 | 33.089 | 0.311 | 0.097 |
| -1.077999999999999 | 3.197 | 10.218 | 32.663 | 0.313 | 0.098 |
| -1.075999999999999 | 3.183 | 10.131 | 32.244 | 0.314 | 0.099 |
| -1.073999999999999 | 3.169 | 10.044 | 31.831 | 0.316 | 0.1 |
| -1.071999999999999 | 3.156 | 9.958 | 31.423 | 0.317 | 0.1 |
| -1.069999999999999 | 3.142 | 9.873 | 31.022 | 0.318 | 0.101 |
| -1.067999999999999 | 3.129 | 9.789 | 30.627 | 0.32 | 0.102 |
| -1.065999999999999 | 3.115 | 9.706 | 30.237 | 0.321 | 0.103 |
| -1.063999999999999 | 3.102 | 9.623 | 29.853 | 0.322 | 0.104 |
| -1.061999999999999 | 3.089 | 9.542 | 29.475 | 0.324 | 0.105 |
| -1.059999999999999 | 3.076 | 9.461 | 29.102 | 0.325 | 0.106 |
| -1.057999999999999 | 3.063 | 9.381 | 28.734 | 0.326 | 0.107 |
| -1.055999999999999 | 3.05 | 9.302 | 28.372 | 0.328 | 0.107 |
| -1.053999999999999 | 3.037 | 9.224 | 28.015 | 0.329 | 0.108 |
| -1.051999999999999 | 3.024 | 9.147 | 27.663 | 0.331 | 0.109 |
| -1.049999999999999 | 3.012 | 9.07 | 27.317 | 0.332 | 0.11 |
| -1.047999999999999 | 2.999 | 8.994 | 26.975 | 0.333 | 0.111 |
| -1.045999999999999 | 2.987 | 8.919 | 26.638 | 0.335 | 0.112 |
| -1.043999999999999 | 2.974 | 8.845 | 26.306 | 0.336 | 0.113 |
| -1.041999999999999 | 2.962 | 8.772 | 25.979 | 0.338 | 0.114 |
| -1.039999999999999 | 2.949 | 8.699 | 25.657 | 0.339 | 0.115 |
| -1.037999999999999 | 2.937 | 8.627 | 25.339 | 0.34 | 0.116 |
| -1.035999999999999 | 2.925 | 8.556 | 25.025 | 0.342 | 0.117 |
| -1.033999999999999 | 2.913 | 8.485 | 24.716 | 0.343 | 0.118 |
| -1.031999999999999 | 2.901 | 8.415 | 24.412 | 0.345 | 0.119 |
| -1.029999999999999 | 2.889 | 8.346 | 24.112 | 0.346 | 0.12 |
| -1.027999999999999 | 2.877 | 8.278 | 23.816 | 0.348 | 0.121 |
| -1.025999999999999 | 2.865 | 8.21 | 23.524 | 0.349 | 0.122 |
| -1.023999999999999 | 2.854 | 8.143 | 23.237 | 0.35 | 0.123 |
| -1.021999999999999 | 2.842 | 8.077 | 22.953 | 0.352 | 0.124 |
| -1.019999999999999 | 2.83 | 8.011 | 22.674 | 0.353 | 0.125 |
| -1.017999999999999 | 2.819 | 7.946 | 22.398 | 0.355 | 0.126 |
| -1.015999999999999 | 2.807 | 7.881 | 22.126 | 0.356 | 0.127 |
| -1.013999999999999 | 2.796 | 7.818 | 21.858 | 0.358 | 0.128 |
| -1.011999999999999 | 2.785 | 7.755 | 21.594 | 0.359 | 0.129 |
| -1.009999999999999 | 2.773 | 7.692 | 21.334 | 0.361 | 0.13 |
| -1.007999999999999 | 2.762 | 7.63 | 21.077 | 0.362 | 0.131 |
| -1.005999999999999 | 2.751 | 7.569 | 20.824 | 0.363 | 0.132 |
| -1.003999999999999 | 2.74 | 7.508 | 20.574 | 0.365 | 0.133 |
| -1.001999999999999 | 2.729 | 7.448 | 20.328 | 0.366 | 0.134 |
| -0.999999999999999 | 2.718 | 7.389 | 20.086 | 0.368 | 0.135 |
| -0.997999999999999 | 2.707 | 7.33 | 19.846 | 0.369 | 0.136 |
| -0.995999999999999 | 2.697 | 7.272 | 19.61 | 0.371 | 0.138 |
| -0.993999999999999 | 2.686 | 7.214 | 19.377 | 0.372 | 0.139 |
| -0.991999999999999 | 2.675 | 7.157 | 19.148 | 0.374 | 0.14 |
| -0.989999999999999 | 2.665 | 7.101 | 18.922 | 0.375 | 0.141 |
| -0.987999999999999 | 2.654 | 7.045 | 18.698 | 0.377 | 0.142 |
| -0.985999999999999 | 2.644 | 6.989 | 18.478 | 0.378 | 0.143 |
| -0.983999999999999 | 2.633 | 6.935 | 18.261 | 0.38 | 0.144 |
| -0.981999999999999 | 2.623 | 6.88 | 18.047 | 0.381 | 0.145 |
| -0.979999999999999 | 2.613 | 6.826 | 17.836 | 0.383 | 0.146 |
| -0.977999999999999 | 2.603 | 6.773 | 17.627 | 0.384 | 0.148 |
| -0.975999999999999 | 2.592 | 6.72 | 17.422 | 0.386 | 0.149 |
| -0.973999999999999 | 2.582 | 6.668 | 17.219 | 0.387 | 0.15 |
| -0.971999999999999 | 2.572 | 6.617 | 17.019 | 0.389 | 0.151 |
| -0.969999999999999 | 2.562 | 6.565 | 16.822 | 0.39 | 0.152 |
| -0.967999999999999 | 2.552 | 6.515 | 16.628 | 0.392 | 0.154 |
| -0.965999999999999 | 2.543 | 6.464 | 16.436 | 0.393 | 0.155 |
| -0.963999999999999 | 2.533 | 6.415 | 16.247 | 0.395 | 0.156 |
| -0.961999999999999 | 2.523 | 6.365 | 16.06 | 0.396 | 0.157 |
| -0.959999999999999 | 2.513 | 6.317 | 15.876 | 0.398 | 0.158 |
| -0.957999999999999 | 2.504 | 6.268 | 15.694 | 0.399 | 0.16 |
| -0.955999999999999 | 2.494 | 6.221 | 15.515 | 0.401 | 0.161 |
| -0.953999999999999 | 2.485 | 6.173 | 15.338 | 0.402 | 0.162 |
| -0.951999999999999 | 2.475 | 6.126 | 15.164 | 0.404 | 0.163 |
| -0.949999999999999 | 2.466 | 6.08 | 14.992 | 0.406 | 0.164 |
| -0.947999999999999 | 2.456 | 6.034 | 14.822 | 0.407 | 0.166 |
| -0.945999999999999 | 2.447 | 5.988 | 14.655 | 0.409 | 0.167 |
| -0.943999999999999 | 2.438 | 5.943 | 14.489 | 0.41 | 0.168 |
| -0.941999999999999 | 2.429 | 5.899 | 14.326 | 0.412 | 0.17 |
| -0.939999999999999 | 2.42 | 5.854 | 14.165 | 0.413 | 0.171 |
| -0.937999999999999 | 2.411 | 5.811 | 14.007 | 0.415 | 0.172 |
| -0.935999999999999 | 2.402 | 5.767 | 13.85 | 0.416 | 0.173 |
| -0.933999999999999 | 2.393 | 5.724 | 13.696 | 0.418 | 0.175 |
| -0.931999999999999 | 2.384 | 5.682 | 13.543 | 0.42 | 0.176 |
| -0.929999999999999 | 2.375 | 5.64 | 13.393 | 0.421 | 0.177 |
| -0.927999999999999 | 2.366 | 5.598 | 13.244 | 0.423 | 0.179 |
| -0.925999999999999 | 2.357 | 5.556 | 13.098 | 0.424 | 0.18 |
| -0.923999999999999 | 2.348 | 5.515 | 12.953 | 0.426 | 0.181 |
| -0.921999999999999 | 2.34 | 5.475 | 12.81 | 0.427 | 0.183 |
| -0.919999999999999 | 2.331 | 5.435 | 12.67 | 0.429 | 0.184 |
| -0.917999999999999 | 2.323 | 5.395 | 12.531 | 0.431 | 0.185 |
| -0.915999999999999 | 2.314 | 5.355 | 12.393 | 0.432 | 0.187 |
| -0.913999999999999 | 2.306 | 5.316 | 12.258 | 0.434 | 0.188 |
| -0.911999999999999 | 2.297 | 5.278 | 12.125 | 0.435 | 0.189 |
| -0.909999999999999 | 2.289 | 5.239 | 11.993 | 0.437 | 0.191 |
| -0.907999999999999 | 2.281 | 5.201 | 11.863 | 0.438 | 0.192 |
| -0.905999999999999 | 2.272 | 5.164 | 11.734 | 0.44 | 0.194 |
| -0.903999999999999 | 2.264 | 5.127 | 11.607 | 0.442 | 0.195 |
| -0.901999999999999 | 2.256 | 5.09 | 11.482 | 0.443 | 0.196 |
| -0.899999999999999 | 2.248 | 5.053 | 11.359 | 0.445 | 0.198 |
| -0.897999999999999 | 2.24 | 5.017 | 11.237 | 0.446 | 0.199 |
| -0.895999999999999 | 2.232 | 4.981 | 11.117 | 0.448 | 0.201 |
| -0.893999999999999 | 2.224 | 4.945 | 10.998 | 0.45 | 0.202 |
| -0.891999999999999 | 2.216 | 4.91 | 10.881 | 0.451 | 0.204 |
| -0.889999999999999 | 2.208 | 4.875 | 10.765 | 0.453 | 0.205 |
| -0.887999999999999 | 2.2 | 4.841 | 10.651 | 0.455 | 0.207 |
| -0.885999999999999 | 2.192 | 4.807 | 10.538 | 0.456 | 0.208 |
| -0.883999999999999 | 2.185 | 4.773 | 10.427 | 0.458 | 0.21 |
| -0.881999999999999 | 2.177 | 4.739 | 10.317 | 0.459 | 0.211 |
| -0.879999999999999 | 2.169 | 4.706 | 10.208 | 0.461 | 0.213 |
| -0.877999999999999 | 2.162 | 4.673 | 10.101 | 0.463 | 0.214 |
| -0.875999999999999 | 2.154 | 4.64 | 9.995 | 0.464 | 0.216 |
| -0.873999999999999 | 2.147 | 4.608 | 9.891 | 0.466 | 0.217 |
| -0.871999999999999 | 2.139 | 4.576 | 9.788 | 0.467 | 0.219 |
| -0.869999999999999 | 2.132 | 4.544 | 9.686 | 0.469 | 0.22 |
| -0.867999999999999 | 2.124 | 4.512 | 9.586 | 0.471 | 0.222 |
| -0.865999999999999 | 2.117 | 4.481 | 9.486 | 0.472 | 0.223 |
| -0.863999999999999 | 2.11 | 4.45 | 9.389 | 0.474 | 0.225 |
| -0.861999999999999 | 2.102 | 4.42 | 9.292 | 0.476 | 0.226 |
| -0.859999999999999 | 2.095 | 4.389 | 9.196 | 0.477 | 0.228 |
| -0.857999999999999 | 2.088 | 4.359 | 9.102 | 0.479 | 0.229 |
| -0.855999999999999 | 2.081 | 4.33 | 9.009 | 0.481 | 0.231 |
| -0.853999999999999 | 2.074 | 4.3 | 8.917 | 0.482 | 0.233 |
| -0.851999999999999 | 2.067 | 4.271 | 8.826 | 0.484 | 0.234 |
| -0.849999999999999 | 2.06 | 4.242 | 8.736 | 0.486 | 0.236 |
| -0.847999999999999 | 2.053 | 4.213 | 8.648 | 0.487 | 0.237 |
| -0.845999999999999 | 2.046 | 4.185 | 8.56 | 0.489 | 0.239 |
| -0.843999999999999 | 2.039 | 4.156 | 8.474 | 0.49 | 0.241 |
| -0.841999999999999 | 2.032 | 4.129 | 8.389 | 0.492 | 0.242 |
| -0.839999999999999 | 2.025 | 4.101 | 8.305 | 0.494 | 0.244 |
| -0.837999999999999 | 2.018 | 4.073 | 8.221 | 0.495 | 0.245 |
| -0.835999999999999 | 2.012 | 4.046 | 8.139 | 0.497 | 0.247 |
| -0.833999999999999 | 2.005 | 4.019 | 8.058 | 0.499 | 0.249 |
| -0.831999999999999 | 1.998 | 3.993 | 7.978 | 0.5 | 0.25 |
| -0.829999999999999 | 1.992 | 3.966 | 7.899 | 0.502 | 0.252 |
| -0.827999999999999 | 1.985 | 3.94 | 7.821 | 0.504 | 0.254 |
| -0.825999999999999 | 1.978 | 3.914 | 7.743 | 0.505 | 0.255 |
| -0.823999999999999 | 1.972 | 3.888 | 7.667 | 0.507 | 0.257 |
| -0.821999999999999 | 1.965 | 3.863 | 7.592 | 0.509 | 0.259 |
| -0.819999999999999 | 1.959 | 3.837 | 7.517 | 0.51 | 0.261 |
| -0.817999999999999 | 1.953 | 3.812 | 7.444 | 0.512 | 0.262 |
| -0.815999999999999 | 1.946 | 3.788 | 7.371 | 0.514 | 0.264 |
| -0.813999999999999 | 1.94 | 3.763 | 7.299 | 0.516 | 0.266 |
| -0.811999999999999 | 1.934 | 3.739 | 7.229 | 0.517 | 0.267 |
| -0.809999999999999 | 1.927 | 3.714 | 7.158 | 0.519 | 0.269 |
| -0.807999999999999 | 1.921 | 3.69 | 7.089 | 0.521 | 0.271 |
| -0.805999999999999 | 1.915 | 3.667 | 7.021 | 0.522 | 0.273 |
| -0.803999999999999 | 1.909 | 3.643 | 6.954 | 0.524 | 0.274 |
| -0.801999999999999 | 1.903 | 3.62 | 6.887 | 0.526 | 0.276 |
| -0.799999999999999 | 1.896 | 3.597 | 6.821 | 0.527 | 0.278 |
| -0.797999999999999 | 1.89 | 3.574 | 6.756 | 0.529 | 0.28 |
| -0.795999999999999 | 1.884 | 3.551 | 6.692 | 0.531 | 0.282 |
| -0.793999999999999 | 1.878 | 3.528 | 6.628 | 0.532 | 0.283 |
| -0.791999999999999 | 1.872 | 3.506 | 6.565 | 0.534 | 0.285 |
| -0.789999999999999 | 1.867 | 3.484 | 6.503 | 0.536 | 0.287 |
| -0.787999999999999 | 1.861 | 3.462 | 6.442 | 0.537 | 0.289 |
| -0.785999999999999 | 1.855 | 3.44 | 6.381 | 0.539 | 0.291 |
| -0.783999999999999 | 1.849 | 3.419 | 6.322 | 0.541 | 0.292 |
| -0.781999999999999 | 1.843 | 3.398 | 6.262 | 0.543 | 0.294 |
| -0.779999999999999 | 1.837 | 3.376 | 6.204 | 0.544 | 0.296 |
| -0.777999999999999 | 1.832 | 3.355 | 6.146 | 0.546 | 0.298 |
| -0.775999999999999 | 1.826 | 3.335 | 6.089 | 0.548 | 0.3 |
| -0.773999999999999 | 1.82 | 3.314 | 6.033 | 0.549 | 0.302 |
| -0.771999999999999 | 1.815 | 3.294 | 5.977 | 0.551 | 0.304 |
| -0.769999999999999 | 1.809 | 3.273 | 5.922 | 0.553 | 0.306 |
| -0.767999999999999 | 1.804 | 3.253 | 5.868 | 0.554 | 0.307 |
| -0.765999999999999 | 1.798 | 3.233 | 5.814 | 0.556 | 0.309 |
| -0.763999999999999 | 1.793 | 3.214 | 5.761 | 0.558 | 0.311 |
| -0.761999999999999 | 1.787 | 3.194 | 5.708 | 0.56 | 0.313 |
| -0.759999999999999 | 1.782 | 3.175 | 5.656 | 0.561 | 0.315 |
| -0.757999999999999 | 1.776 | 3.155 | 5.605 | 0.563 | 0.317 |
| -0.755999999999999 | 1.771 | 3.136 | 5.554 | 0.565 | 0.319 |
| -0.753999999999999 | 1.766 | 3.118 | 5.504 | 0.566 | 0.321 |
| -0.751999999999999 | 1.76 | 3.099 | 5.455 | 0.568 | 0.323 |
| -0.749999999999999 | 1.755 | 3.08 | 5.406 | 0.57 | 0.325 |
| -0.747999999999999 | 1.75 | 3.062 | 5.358 | 0.571 | 0.327 |
| -0.745999999999999 | 1.745 | 3.044 | 5.31 | 0.573 | 0.329 |
| -0.743999999999999 | 1.739 | 3.025 | 5.263 | 0.575 | 0.331 |
| -0.741999999999999 | 1.734 | 3.008 | 5.216 | 0.577 | 0.332 |
| -0.739999999999999 | 1.729 | 2.99 | 5.17 | 0.578 | 0.334 |
| -0.737999999999999 | 1.724 | 2.972 | 5.124 | 0.58 | 0.336 |
| -0.735999999999999 | 1.719 | 2.955 | 5.079 | 0.582 | 0.338 |
| -0.733999999999999 | 1.714 | 2.937 | 5.034 | 0.583 | 0.34 |
| -0.731999999999999 | 1.709 | 2.92 | 4.99 | 0.585 | 0.342 |
| -0.729999999999999 | 1.704 | 2.903 | 4.947 | 0.587 | 0.344 |
| -0.727999999999999 | 1.699 | 2.886 | 4.904 | 0.589 | 0.346 |
| -0.725999999999999 | 1.694 | 2.87 | 4.861 | 0.59 | 0.348 |
| -0.723999999999999 | 1.689 | 2.853 | 4.819 | 0.592 | 0.351 |
| -0.721999999999999 | 1.684 | 2.836 | 4.777 | 0.594 | 0.353 |
| -0.719999999999999 | 1.679 | 2.82 | 4.736 | 0.595 | 0.355 |
| -0.717999999999999 | 1.675 | 2.804 | 4.695 | 0.597 | 0.357 |
| -0.715999999999999 | 1.67 | 2.788 | 4.655 | 0.599 | 0.359 |
| -0.713999999999999 | 1.665 | 2.772 | 4.615 | 0.601 | 0.361 |
| -0.711999999999999 | 1.66 | 2.756 | 4.576 | 0.602 | 0.363 |
| -0.709999999999999 | 1.655 | 2.741 | 4.537 | 0.604 | 0.365 |
| -0.707999999999999 | 1.651 | 2.725 | 4.499 | 0.606 | 0.367 |
| -0.705999999999999 | 1.646 | 2.71 | 4.461 | 0.607 | 0.369 |
| -0.703999999999999 | 1.642 | 2.695 | 4.423 | 0.609 | 0.371 |
| -0.701999999999999 | 1.637 | 2.679 | 4.386 | 0.611 | 0.373 |
| -0.699999999999999 | 1.632 | 2.664 | 4.349 | 0.613 | 0.375 |
| -0.697999999999999 | 1.628 | 2.65 | 4.313 | 0.614 | 0.377 |
| -0.695999999999999 | 1.623 | 2.635 | 4.277 | 0.616 | 0.38 |
| -0.693999999999999 | 1.619 | 2.62 | 4.241 | 0.618 | 0.382 |
| -0.691999999999999 | 1.614 | 2.606 | 4.206 | 0.619 | 0.384 |
| -0.689999999999999 | 1.61 | 2.591 | 4.172 | 0.621 | 0.386 |
| -0.687999999999999 | 1.605 | 2.577 | 4.137 | 0.623 | 0.388 |
| -0.685999999999999 | 1.601 | 2.563 | 4.103 | 0.625 | 0.39 |
| -0.683999999999999 | 1.597 | 2.549 | 4.07 | 0.626 | 0.392 |
| -0.681999999999999 | 1.592 | 2.535 | 4.036 | 0.628 | 0.394 |
| -0.679999999999999 | 1.588 | 2.521 | 4.004 | 0.63 | 0.397 |
| -0.677999999999999 | 1.584 | 2.508 | 3.971 | 0.631 | 0.399 |
| -0.675999999999999 | 1.579 | 2.494 | 3.939 | 0.633 | 0.401 |
| -0.673999999999999 | 1.575 | 2.481 | 3.907 | 0.635 | 0.403 |
| -0.671999999999999 | 1.571 | 2.467 | 3.876 | 0.637 | 0.405 |
| -0.669999999999999 | 1.567 | 2.454 | 3.845 | 0.638 | 0.407 |
| -0.667999999999999 | 1.562 | 2.441 | 3.814 | 0.64 | 0.41 |
| -0.665999999999999 | 1.558 | 2.428 | 3.784 | 0.642 | 0.412 |
| -0.663999999999999 | 1.554 | 2.415 | 3.753 | 0.643 | 0.414 |
| -0.661999999999999 | 1.55 | 2.402 | 3.724 | 0.645 | 0.416 |
| -0.659999999999999 | 1.546 | 2.39 | 3.694 | 0.647 | 0.418 |
| -0.657999999999999 | 1.542 | 2.377 | 3.665 | 0.649 | 0.421 |
| -0.655999999999999 | 1.538 | 2.365 | 3.636 | 0.65 | 0.423 |
| -0.653999999999999 | 1.534 | 2.352 | 3.608 | 0.652 | 0.425 |
| -0.651999999999999 | 1.53 | 2.34 | 3.58 | 0.654 | 0.427 |
| -0.649999999999999 | 1.526 | 2.328 | 3.552 | 0.655 | 0.43 |
| -0.647999999999999 | 1.522 | 2.316 | 3.524 | 0.657 | 0.432 |
| -0.645999999999999 | 1.518 | 2.304 | 3.497 | 0.659 | 0.434 |
| -0.643999999999999 | 1.514 | 2.292 | 3.47 | 0.661 | 0.436 |
| -0.641999999999999 | 1.51 | 2.28 | 3.444 | 0.662 | 0.439 |
| -0.639999999999999 | 1.506 | 2.269 | 3.417 | 0.664 | 0.441 |
| -0.637999999999999 | 1.502 | 2.257 | 3.391 | 0.666 | 0.443 |
| -0.635999999999999 | 1.499 | 2.246 | 3.365 | 0.667 | 0.445 |
| -0.633999999999999 | 1.495 | 2.234 | 3.34 | 0.669 | 0.448 |
| -0.631999999999999 | 1.491 | 2.223 | 3.314 | 0.671 | 0.45 |
| -0.629999999999999 | 1.487 | 2.212 | 3.289 | 0.672 | 0.452 |
| -0.627999999999999 | 1.483 | 2.201 | 3.265 | 0.674 | 0.454 |
| -0.625999999999999 | 1.48 | 2.19 | 3.24 | 0.676 | 0.457 |
| -0.623999999999999 | 1.476 | 2.179 | 3.216 | 0.677 | 0.459 |
| -0.621999999999999 | 1.472 | 2.168 | 3.192 | 0.679 | 0.461 |
| -0.619999999999999 | 1.469 | 2.157 | 3.168 | 0.681 | 0.464 |
| -0.617999999999999 | 1.465 | 2.147 | 3.145 | 0.683 | 0.466 |
| -0.615999999999999 | 1.461 | 2.136 | 3.122 | 0.684 | 0.468 |
| -0.613999999999999 | 1.458 | 2.125 | 3.099 | 0.686 | 0.47 |
| -0.611999999999999 | 1.454 | 2.115 | 3.076 | 0.688 | 0.473 |
| -0.609999999999999 | 1.451 | 2.105 | 3.054 | 0.689 | 0.475 |
| -0.607999999999999 | 1.447 | 2.095 | 3.031 | 0.691 | 0.477 |
| -0.605999999999999 | 1.444 | 2.084 | 3.009 | 0.693 | 0.48 |
| -0.603999999999999 | 1.44 | 2.074 | 2.988 | 0.694 | 0.482 |
| -0.601999999999999 | 1.437 | 2.064 | 2.966 | 0.696 | 0.484 |
| -0.599999999999999 | 1.433 | 2.054 | 2.945 | 0.698 | 0.487 |
| -0.597999999999999 | 1.43 | 2.045 | 2.924 | 0.699 | 0.489 |
| -0.595999999999999 | 1.426 | 2.035 | 2.903 | 0.701 | 0.491 |
| -0.593999999999999 | 1.423 | 2.025 | 2.882 | 0.703 | 0.494 |
| -0.591999999999999 | 1.42 | 2.016 | 2.862 | 0.704 | 0.496 |
| -0.589999999999999 | 1.416 | 2.006 | 2.841 | 0.706 | 0.498 |
| -0.587999999999999 | 1.413 | 1.997 | 2.821 | 0.708 | 0.501 |
| -0.585999999999999 | 1.41 | 1.987 | 2.802 | 0.709 | 0.503 |
| -0.583999999999999 | 1.406 | 1.978 | 2.782 | 0.711 | 0.506 |
| -0.581999999999999 | 1.403 | 1.969 | 2.763 | 0.713 | 0.508 |
| -0.579999999999999 | 1.4 | 1.96 | 2.743 | 0.714 | 0.51 |
| -0.577999999999999 | 1.397 | 1.951 | 2.724 | 0.716 | 0.513 |
| -0.575999999999999 | 1.393 | 1.942 | 2.706 | 0.718 | 0.515 |
| -0.573999999999999 | 1.39 | 1.933 | 2.687 | 0.719 | 0.517 |
| -0.571999999999999 | 1.387 | 1.924 | 2.669 | 0.721 | 0.52 |
| -0.569999999999999 | 1.384 | 1.915 | 2.65 | 0.723 | 0.522 |
| -0.567999999999999 | 1.381 | 1.906 | 2.632 | 0.724 | 0.525 |
| -0.565999999999999 | 1.378 | 1.898 | 2.614 | 0.726 | 0.527 |
| -0.563999999999999 | 1.375 | 1.889 | 2.597 | 0.728 | 0.529 |
| -0.561999999999999 | 1.371 | 1.881 | 2.579 | 0.729 | 0.532 |
| -0.559999999999999 | 1.368 | 1.872 | 2.562 | 0.731 | 0.534 |
| -0.557999999999999 | 1.365 | 1.864 | 2.545 | 0.732 | 0.536 |
| -0.555999999999999 | 1.362 | 1.856 | 2.528 | 0.734 | 0.539 |
| -0.553999999999999 | 1.359 | 1.847 | 2.511 | 0.736 | 0.541 |
| -0.551999999999999 | 1.356 | 1.839 | 2.495 | 0.737 | 0.544 |
| -0.549999999999999 | 1.353 | 1.831 | 2.478 | 0.739 | 0.546 |
| -0.547999999999999 | 1.35 | 1.823 | 2.462 | 0.741 | 0.548 |
| -0.545999999999999 | 1.347 | 1.815 | 2.446 | 0.742 | 0.551 |
| -0.543999999999999 | 1.344 | 1.807 | 2.43 | 0.744 | 0.553 |
| -0.541999999999999 | 1.341 | 1.8 | 2.414 | 0.745 | 0.556 |
| -0.539999999999999 | 1.339 | 1.792 | 2.398 | 0.747 | 0.558 |
| -0.537999999999999 | 1.336 | 1.784 | 2.383 | 0.749 | 0.561 |
| -0.535999999999999 | 1.333 | 1.776 | 2.368 | 0.75 | 0.563 |
| -0.533999999999999 | 1.33 | 1.769 | 2.352 | 0.752 | 0.565 |
| -0.531999999999999 | 1.327 | 1.761 | 2.337 | 0.754 | 0.568 |
| -0.529999999999999 | 1.324 | 1.754 | 2.323 | 0.755 | 0.57 |
| -0.527999999999999 | 1.322 | 1.746 | 2.308 | 0.757 | 0.573 |
| -0.525999999999999 | 1.319 | 1.739 | 2.293 | 0.758 | 0.575 |
| -0.523999999999999 | 1.316 | 1.732 | 2.279 | 0.76 | 0.577 |
| -0.521999999999999 | 1.313 | 1.725 | 2.265 | 0.761 | 0.58 |
| -0.519999999999999 | 1.31 | 1.717 | 2.251 | 0.763 | 0.582 |
| -0.517999999999999 | 1.308 | 1.71 | 2.237 | 0.765 | 0.585 |
| -0.515999999999999 | 1.305 | 1.703 | 2.223 | 0.766 | 0.587 |
| -0.513999999999999 | 1.302 | 1.696 | 2.209 | 0.768 | 0.59 |
| -0.511999999999999 | 1.3 | 1.689 | 2.196 | 0.769 | 0.592 |
| -0.509999999999999 | 1.297 | 1.682 | 2.182 | 0.771 | 0.594 |
| -0.507999999999999 | 1.294 | 1.676 | 2.169 | 0.773 | 0.597 |
| -0.505999999999999 | 1.292 | 1.669 | 2.156 | 0.774 | 0.599 |
| -0.503999999999999 | 1.289 | 1.662 | 2.143 | 0.776 | 0.602 |
| -0.501999999999999 | 1.287 | 1.655 | 2.13 | 0.777 | 0.604 |
| -0.499999999999999 | 1.284 | 1.649 | 2.117 | 0.779 | 0.607 |
| -0.497999999999999 | 1.281 | 1.642 | 2.104 | 0.78 | 0.609 |
| -0.495999999999999 | 1.279 | 1.636 | 2.092 | 0.782 | 0.611 |
| -0.493999999999999 | 1.276 | 1.629 | 2.079 | 0.783 | 0.614 |
| -0.491999999999999 | 1.274 | 1.623 | 2.067 | 0.785 | 0.616 |
| -0.489999999999999 | 1.271 | 1.616 | 2.055 | 0.787 | 0.619 |
| -0.487999999999999 | 1.269 | 1.61 | 2.043 | 0.788 | 0.621 |
| -0.485999999999999 | 1.266 | 1.604 | 2.031 | 0.79 | 0.624 |
| -0.483999999999999 | 1.264 | 1.598 | 2.019 | 0.791 | 0.626 |
| -0.481999999999999 | 1.262 | 1.591 | 2.008 | 0.793 | 0.628 |
| -0.479999999999999 | 1.259 | 1.585 | 1.996 | 0.794 | 0.631 |
| -0.477999999999999 | 1.257 | 1.579 | 1.985 | 0.796 | 0.633 |
| -0.475999999999999 | 1.254 | 1.573 | 1.973 | 0.797 | 0.636 |
| -0.473999999999999 | 1.252 | 1.567 | 1.962 | 0.799 | 0.638 |
| -0.471999999999999 | 1.25 | 1.561 | 1.951 | 0.8 | 0.64 |
| -0.469999999999999 | 1.247 | 1.556 | 1.94 | 0.802 | 0.643 |
| -0.467999999999999 | 1.245 | 1.55 | 1.929 | 0.803 | 0.645 |
| -0.465999999999999 | 1.243 | 1.544 | 1.918 | 0.805 | 0.648 |
| -0.463999999999999 | 1.24 | 1.538 | 1.908 | 0.806 | 0.65 |
| -0.461999999999999 | 1.238 | 1.532 | 1.897 | 0.808 | 0.653 |
| -0.459999999999999 | 1.236 | 1.527 | 1.887 | 0.809 | 0.655 |
| -0.457999999999999 | 1.233 | 1.521 | 1.876 | 0.811 | 0.657 |
| -0.455999999999999 | 1.231 | 1.516 | 1.866 | 0.812 | 0.66 |
| -0.453999999999999 | 1.229 | 1.51 | 1.856 | 0.814 | 0.662 |
| -0.451999999999999 | 1.227 | 1.505 | 1.846 | 0.815 | 0.665 |
| -0.449999999999999 | 1.224 | 1.499 | 1.836 | 0.817 | 0.667 |
| -0.447999999999999 | 1.222 | 1.494 | 1.826 | 0.818 | 0.669 |
| -0.445999999999999 | 1.22 | 1.489 | 1.816 | 0.82 | 0.672 |
| -0.443999999999999 | 1.218 | 1.483 | 1.807 | 0.821 | 0.674 |
| -0.441999999999999 | 1.216 | 1.478 | 1.797 | 0.823 | 0.677 |
| -0.439999999999999 | 1.214 | 1.473 | 1.787 | 0.824 | 0.679 |
| -0.437999999999999 | 1.211 | 1.468 | 1.778 | 0.825 | 0.681 |
| -0.435999999999999 | 1.209 | 1.463 | 1.769 | 0.827 | 0.684 |
| -0.433999999999999 | 1.207 | 1.457 | 1.76 | 0.828 | 0.686 |
| -0.431999999999999 | 1.205 | 1.452 | 1.75 | 0.83 | 0.688 |
| -0.429999999999999 | 1.203 | 1.447 | 1.741 | 0.831 | 0.691 |
| -0.427999999999999 | 1.201 | 1.442 | 1.732 | 0.833 | 0.693 |
| -0.425999999999999 | 1.199 | 1.438 | 1.724 | 0.834 | 0.696 |
| -0.423999999999999 | 1.197 | 1.433 | 1.715 | 0.835 | 0.698 |
| -0.421999999999999 | 1.195 | 1.428 | 1.706 | 0.837 | 0.7 |
| -0.419999999999999 | 1.193 | 1.423 | 1.698 | 0.838 | 0.703 |
| -0.417999999999999 | 1.191 | 1.418 | 1.689 | 0.84 | 0.705 |
| -0.415999999999999 | 1.189 | 1.414 | 1.681 | 0.841 | 0.707 |
| -0.413999999999999 | 1.187 | 1.409 | 1.672 | 0.842 | 0.71 |
| -0.411999999999999 | 1.185 | 1.404 | 1.664 | 0.844 | 0.712 |
| -0.409999999999999 | 1.183 | 1.4 | 1.656 | 0.845 | 0.714 |
| -0.407999999999999 | 1.181 | 1.395 | 1.648 | 0.847 | 0.717 |
| -0.405999999999999 | 1.179 | 1.391 | 1.64 | 0.848 | 0.719 |
| -0.403999999999999 | 1.177 | 1.386 | 1.632 | 0.849 | 0.721 |
| -0.401999999999999 | 1.175 | 1.382 | 1.624 | 0.851 | 0.724 |
| -0.399999999999999 | 1.174 | 1.377 | 1.616 | 0.852 | 0.726 |
| -0.397999999999999 | 1.172 | 1.373 | 1.608 | 0.854 | 0.728 |
| -0.395999999999999 | 1.17 | 1.368 | 1.601 | 0.855 | 0.731 |
| -0.393999999999999 | 1.168 | 1.364 | 1.593 | 0.856 | 0.733 |
| -0.391999999999999 | 1.166 | 1.36 | 1.586 | 0.858 | 0.735 |
| -0.389999999999999 | 1.164 | 1.356 | 1.578 | 0.859 | 0.738 |
| -0.387999999999999 | 1.162 | 1.351 | 1.571 | 0.86 | 0.74 |
| -0.385999999999999 | 1.161 | 1.347 | 1.564 | 0.862 | 0.742 |
| -0.383999999999999 | 1.159 | 1.343 | 1.556 | 0.863 | 0.745 |
| -0.381999999999999 | 1.157 | 1.339 | 1.549 | 0.864 | 0.747 |
| -0.379999999999999 | 1.155 | 1.335 | 1.542 | 0.866 | 0.749 |
| -0.377999999999999 | 1.154 | 1.331 | 1.535 | 0.867 | 0.751 |
| -0.375999999999999 | 1.152 | 1.327 | 1.528 | 0.868 | 0.754 |
| -0.373999999999999 | 1.15 | 1.323 | 1.521 | 0.869 | 0.756 |
| -0.371999999999999 | 1.148 | 1.319 | 1.515 | 0.871 | 0.758 |
| -0.369999999999998 | 1.147 | 1.315 | 1.508 | 0.872 | 0.76 |
| -0.367999999999998 | 1.145 | 1.311 | 1.501 | 0.873 | 0.763 |
| -0.365999999999998 | 1.143 | 1.307 | 1.495 | 0.875 | 0.765 |
| -0.363999999999998 | 1.142 | 1.303 | 1.488 | 0.876 | 0.767 |
| -0.361999999999998 | 1.14 | 1.3 | 1.482 | 0.877 | 0.769 |
| -0.359999999999998 | 1.138 | 1.296 | 1.475 | 0.878 | 0.772 |
| -0.357999999999998 | 1.137 | 1.292 | 1.469 | 0.88 | 0.774 |
| -0.355999999999998 | 1.135 | 1.288 | 1.463 | 0.881 | 0.776 |
| -0.353999999999998 | 1.134 | 1.285 | 1.456 | 0.882 | 0.778 |
| -0.351999999999998 | 1.132 | 1.281 | 1.45 | 0.883 | 0.781 |
| -0.349999999999998 | 1.13 | 1.278 | 1.444 | 0.885 | 0.783 |
| -0.347999999999998 | 1.129 | 1.274 | 1.438 | 0.886 | 0.785 |
| -0.345999999999998 | 1.127 | 1.271 | 1.432 | 0.887 | 0.787 |
| -0.343999999999998 | 1.126 | 1.267 | 1.426 | 0.888 | 0.789 |
| -0.341999999999998 | 1.124 | 1.264 | 1.42 | 0.89 | 0.791 |
| -0.339999999999998 | 1.123 | 1.26 | 1.415 | 0.891 | 0.794 |
| -0.337999999999998 | 1.121 | 1.257 | 1.409 | 0.892 | 0.796 |
| -0.335999999999998 | 1.12 | 1.253 | 1.403 | 0.893 | 0.798 |
| -0.333999999999998 | 1.118 | 1.25 | 1.397 | 0.894 | 0.8 |
| -0.331999999999998 | 1.117 | 1.247 | 1.392 | 0.896 | 0.802 |
| -0.329999999999998 | 1.115 | 1.243 | 1.386 | 0.897 | 0.804 |
| -0.327999999999998 | 1.114 | 1.24 | 1.381 | 0.898 | 0.806 |
| -0.325999999999998 | 1.112 | 1.237 | 1.376 | 0.899 | 0.809 |
| -0.323999999999998 | 1.111 | 1.234 | 1.37 | 0.9 | 0.811 |
| -0.321999999999998 | 1.109 | 1.23 | 1.365 | 0.902 | 0.813 |
| -0.319999999999998 | 1.108 | 1.227 | 1.36 | 0.903 | 0.815 |
| -0.317999999999998 | 1.106 | 1.224 | 1.354 | 0.904 | 0.817 |
| -0.315999999999998 | 1.105 | 1.221 | 1.349 | 0.905 | 0.819 |
| -0.313999999999998 | 1.104 | 1.218 | 1.344 | 0.906 | 0.821 |
| -0.311999999999998 | 1.102 | 1.215 | 1.339 | 0.907 | 0.823 |
| -0.309999999999998 | 1.101 | 1.212 | 1.334 | 0.908 | 0.825 |
| -0.307999999999998 | 1.1 | 1.209 | 1.329 | 0.909 | 0.827 |
| -0.305999999999998 | 1.098 | 1.206 | 1.324 | 0.911 | 0.829 |
| -0.303999999999998 | 1.097 | 1.203 | 1.319 | 0.912 | 0.831 |
| -0.301999999999998 | 1.095 | 1.2 | 1.315 | 0.913 | 0.833 |
| -0.299999999999998 | 1.094 | 1.197 | 1.31 | 0.914 | 0.835 |
| -0.297999999999998 | 1.093 | 1.194 | 1.305 | 0.915 | 0.837 |
| -0.295999999999998 | 1.092 | 1.192 | 1.301 | 0.916 | 0.839 |
| -0.293999999999998 | 1.09 | 1.189 | 1.296 | 0.917 | 0.841 |
| -0.291999999999998 | 1.089 | 1.186 | 1.291 | 0.918 | 0.843 |
| -0.289999999999998 | 1.088 | 1.183 | 1.287 | 0.919 | 0.845 |
| -0.287999999999998 | 1.086 | 1.18 | 1.283 | 0.92 | 0.847 |
| -0.285999999999998 | 1.085 | 1.178 | 1.278 | 0.921 | 0.849 |
| -0.283999999999998 | 1.084 | 1.175 | 1.274 | 0.923 | 0.851 |
| -0.281999999999998 | 1.083 | 1.172 | 1.269 | 0.924 | 0.853 |
| -0.279999999999998 | 1.082 | 1.17 | 1.265 | 0.925 | 0.855 |
| -0.277999999999998 | 1.08 | 1.167 | 1.261 | 0.926 | 0.857 |
| -0.275999999999998 | 1.079 | 1.165 | 1.257 | 0.927 | 0.859 |
| -0.273999999999998 | 1.078 | 1.162 | 1.253 | 0.928 | 0.861 |
| -0.271999999999998 | 1.077 | 1.159 | 1.249 | 0.929 | 0.862 |
| -0.269999999999998 | 1.076 | 1.157 | 1.244 | 0.93 | 0.864 |
| -0.267999999999998 | 1.074 | 1.154 | 1.24 | 0.931 | 0.866 |
| -0.265999999999998 | 1.073 | 1.152 | 1.236 | 0.932 | 0.868 |
| -0.263999999999998 | 1.072 | 1.15 | 1.233 | 0.933 | 0.87 |
| -0.261999999999998 | 1.071 | 1.147 | 1.229 | 0.934 | 0.872 |
| -0.259999999999998 | 1.07 | 1.145 | 1.225 | 0.935 | 0.874 |
| -0.257999999999998 | 1.069 | 1.142 | 1.221 | 0.936 | 0.875 |
| -0.255999999999998 | 1.068 | 1.14 | 1.217 | 0.937 | 0.877 |
| -0.253999999999998 | 1.067 | 1.138 | 1.214 | 0.938 | 0.879 |
| -0.251999999999998 | 1.066 | 1.135 | 1.21 | 0.938 | 0.881 |
| -0.249999999999998 | 1.064 | 1.133 | 1.206 | 0.939 | 0.882 |
| -0.247999999999998 | 1.063 | 1.131 | 1.203 | 0.94 | 0.884 |
| -0.245999999999998 | 1.062 | 1.129 | 1.199 | 0.941 | 0.886 |
| -0.243999999999998 | 1.061 | 1.126 | 1.196 | 0.942 | 0.888 |
| -0.241999999999998 | 1.06 | 1.124 | 1.192 | 0.943 | 0.889 |
| -0.239999999999998 | 1.059 | 1.122 | 1.189 | 0.944 | 0.891 |
| -0.237999999999998 | 1.058 | 1.12 | 1.185 | 0.945 | 0.893 |
| -0.235999999999998 | 1.057 | 1.118 | 1.182 | 0.946 | 0.895 |
| -0.233999999999998 | 1.056 | 1.116 | 1.179 | 0.947 | 0.896 |
| -0.231999999999998 | 1.055 | 1.114 | 1.175 | 0.948 | 0.898 |
| -0.229999999999998 | 1.054 | 1.112 | 1.172 | 0.948 | 0.9 |
| -0.227999999999998 | 1.053 | 1.11 | 1.169 | 0.949 | 0.901 |
| -0.225999999999998 | 1.052 | 1.108 | 1.166 | 0.95 | 0.903 |
| -0.223999999999998 | 1.051 | 1.106 | 1.162 | 0.951 | 0.905 |
| -0.221999999999998 | 1.051 | 1.104 | 1.159 | 0.952 | 0.906 |
| -0.219999999999998 | 1.05 | 1.102 | 1.156 | 0.953 | 0.908 |
| -0.217999999999998 | 1.049 | 1.1 | 1.153 | 0.954 | 0.909 |
| -0.215999999999998 | 1.048 | 1.098 | 1.15 | 0.954 | 0.911 |
| -0.213999999999998 | 1.047 | 1.096 | 1.147 | 0.955 | 0.912 |
| -0.211999999999998 | 1.046 | 1.094 | 1.144 | 0.956 | 0.914 |
| -0.209999999999998 | 1.045 | 1.092 | 1.141 | 0.957 | 0.916 |
| -0.207999999999998 | 1.044 | 1.09 | 1.139 | 0.958 | 0.917 |
| -0.205999999999998 | 1.043 | 1.089 | 1.136 | 0.958 | 0.919 |
| -0.203999999999998 | 1.042 | 1.087 | 1.133 | 0.959 | 0.92 |
| -0.201999999999998 | 1.042 | 1.085 | 1.13 | 0.96 | 0.922 |
| -0.199999999999998 | 1.041 | 1.083 | 1.127 | 0.961 | 0.923 |
| -0.197999999999998 | 1.04 | 1.082 | 1.125 | 0.962 | 0.925 |
| -0.195999999999998 | 1.039 | 1.08 | 1.122 | 0.962 | 0.926 |
| -0.193999999999998 | 1.038 | 1.078 | 1.12 | 0.963 | 0.927 |
| -0.191999999999998 | 1.038 | 1.077 | 1.117 | 0.964 | 0.929 |
| -0.189999999999998 | 1.037 | 1.075 | 1.114 | 0.965 | 0.93 |
| -0.187999999999998 | 1.036 | 1.073 | 1.112 | 0.965 | 0.932 |
| -0.185999999999998 | 1.035 | 1.072 | 1.109 | 0.966 | 0.933 |
| -0.183999999999998 | 1.034 | 1.07 | 1.107 | 0.967 | 0.935 |
| -0.181999999999998 | 1.034 | 1.068 | 1.104 | 0.967 | 0.936 |
| -0.179999999999998 | 1.033 | 1.067 | 1.102 | 0.968 | 0.937 |
| -0.177999999999998 | 1.032 | 1.065 | 1.1 | 0.969 | 0.939 |
| -0.175999999999998 | 1.031 | 1.064 | 1.097 | 0.969 | 0.94 |
| -0.173999999999998 | 1.031 | 1.062 | 1.095 | 0.97 | 0.941 |
| -0.171999999999998 | 1.03 | 1.061 | 1.093 | 0.971 | 0.943 |
| -0.169999999999998 | 1.029 | 1.06 | 1.091 | 0.972 | 0.944 |
| -0.167999999999998 | 1.029 | 1.058 | 1.088 | 0.972 | 0.945 |
| -0.165999999999998 | 1.028 | 1.057 | 1.086 | 0.973 | 0.946 |
| -0.163999999999998 | 1.027 | 1.055 | 1.084 | 0.973 | 0.948 |
| -0.161999999999998 | 1.027 | 1.054 | 1.082 | 0.974 | 0.949 |
| -0.159999999999998 | 1.026 | 1.053 | 1.08 | 0.975 | 0.95 |
| -0.157999999999998 | 1.025 | 1.051 | 1.078 | 0.975 | 0.951 |
| -0.155999999999998 | 1.025 | 1.05 | 1.076 | 0.976 | 0.952 |
| -0.153999999999998 | 1.024 | 1.049 | 1.074 | 0.977 | 0.954 |
| -0.151999999999998 | 1.023 | 1.047 | 1.072 | 0.977 | 0.955 |
| -0.149999999999998 | 1.023 | 1.046 | 1.07 | 0.978 | 0.956 |
| -0.147999999999998 | 1.022 | 1.045 | 1.068 | 0.978 | 0.957 |
| -0.145999999999998 | 1.022 | 1.044 | 1.066 | 0.979 | 0.958 |
| -0.143999999999998 | 1.021 | 1.042 | 1.064 | 0.979 | 0.959 |
| -0.141999999999998 | 1.02 | 1.041 | 1.062 | 0.98 | 0.96 |
| -0.139999999999998 | 1.02 | 1.04 | 1.061 | 0.981 | 0.962 |
| -0.137999999999998 | 1.019 | 1.039 | 1.059 | 0.981 | 0.963 |
| -0.135999999999998 | 1.019 | 1.038 | 1.057 | 0.982 | 0.964 |
| -0.133999999999998 | 1.018 | 1.037 | 1.055 | 0.982 | 0.965 |
| -0.131999999999998 | 1.018 | 1.035 | 1.054 | 0.983 | 0.966 |
| -0.129999999999998 | 1.017 | 1.034 | 1.052 | 0.983 | 0.967 |
| -0.127999999999998 | 1.017 | 1.033 | 1.05 | 0.984 | 0.968 |
| -0.125999999999998 | 1.016 | 1.032 | 1.049 | 0.984 | 0.969 |
| -0.123999999999998 | 1.015 | 1.031 | 1.047 | 0.985 | 0.97 |
| -0.121999999999998 | 1.015 | 1.03 | 1.046 | 0.985 | 0.971 |
| -0.119999999999998 | 1.015 | 1.029 | 1.044 | 0.986 | 0.972 |
| -0.117999999999998 | 1.014 | 1.028 | 1.043 | 0.986 | 0.973 |
| -0.115999999999998 | 1.014 | 1.027 | 1.041 | 0.987 | 0.973 |
| -0.113999999999998 | 1.013 | 1.026 | 1.04 | 0.987 | 0.974 |
| -0.111999999999998 | 1.013 | 1.025 | 1.038 | 0.988 | 0.975 |
| -0.109999999999998 | 1.012 | 1.024 | 1.037 | 0.988 | 0.976 |
| -0.107999999999998 | 1.012 | 1.024 | 1.036 | 0.988 | 0.977 |
| -0.105999999999998 | 1.011 | 1.023 | 1.034 | 0.989 | 0.978 |
| -0.103999999999998 | 1.011 | 1.022 | 1.033 | 0.989 | 0.979 |
| -0.101999999999998 | 1.01 | 1.021 | 1.032 | 0.99 | 0.979 |
| -0.0999999999999983 | 1.01 | 1.02 | 1.03 | 0.99 | 0.98 |
| -0.0979999999999983 | 1.01 | 1.019 | 1.029 | 0.99 | 0.981 |
| -0.0959999999999983 | 1.009 | 1.019 | 1.028 | 0.991 | 0.982 |
| -0.0939999999999983 | 1.009 | 1.018 | 1.027 | 0.991 | 0.982 |
| -0.0919999999999983 | 1.008 | 1.017 | 1.026 | 0.992 | 0.983 |
| -0.0899999999999983 | 1.008 | 1.016 | 1.025 | 0.992 | 0.984 |
| -0.0879999999999983 | 1.008 | 1.016 | 1.024 | 0.992 | 0.985 |
| -0.0859999999999983 | 1.007 | 1.015 | 1.022 | 0.993 | 0.985 |
| -0.0839999999999983 | 1.007 | 1.014 | 1.021 | 0.993 | 0.986 |
| -0.0819999999999983 | 1.007 | 1.014 | 1.02 | 0.993 | 0.987 |
| -0.0799999999999983 | 1.006 | 1.013 | 1.019 | 0.994 | 0.987 |
| -0.0779999999999983 | 1.006 | 1.012 | 1.018 | 0.994 | 0.988 |
| -0.0759999999999983 | 1.006 | 1.012 | 1.017 | 0.994 | 0.989 |
| -0.0739999999999983 | 1.005 | 1.011 | 1.017 | 0.995 | 0.989 |
| -0.0719999999999983 | 1.005 | 1.01 | 1.016 | 0.995 | 0.99 |
| -0.0699999999999983 | 1.005 | 1.01 | 1.015 | 0.995 | 0.99 |
| -0.0679999999999983 | 1.005 | 1.009 | 1.014 | 0.995 | 0.991 |
| -0.0659999999999983 | 1.004 | 1.009 | 1.013 | 0.996 | 0.991 |
| -0.0639999999999983 | 1.004 | 1.008 | 1.012 | 0.996 | 0.992 |
| -0.0619999999999983 | 1.004 | 1.008 | 1.012 | 0.996 | 0.992 |
| -0.0599999999999983 | 1.004 | 1.007 | 1.011 | 0.996 | 0.993 |
| -0.0579999999999983 | 1.003 | 1.007 | 1.01 | 0.997 | 0.993 |
| -0.0559999999999983 | 1.003 | 1.006 | 1.009 | 0.997 | 0.994 |
| -0.0539999999999983 | 1.003 | 1.006 | 1.009 | 0.997 | 0.994 |
| -0.0519999999999983 | 1.003 | 1.005 | 1.008 | 0.997 | 0.995 |
| -0.0499999999999983 | 1.003 | 1.005 | 1.008 | 0.998 | 0.995 |
| -0.0479999999999983 | 1.002 | 1.005 | 1.007 | 0.998 | 0.995 |
| -0.0459999999999983 | 1.002 | 1.004 | 1.006 | 0.998 | 0.996 |
| -0.0439999999999983 | 1.002 | 1.004 | 1.006 | 0.998 | 0.996 |
| -0.0419999999999983 | 1.002 | 1.004 | 1.005 | 0.998 | 0.996 |
| -0.0399999999999983 | 1.002 | 1.003 | 1.005 | 0.998 | 0.997 |
| -0.0379999999999982 | 1.001 | 1.003 | 1.004 | 0.999 | 0.997 |
| -0.0359999999999982 | 1.001 | 1.003 | 1.004 | 0.999 | 0.997 |
| -0.0339999999999982 | 1.001 | 1.002 | 1.003 | 0.999 | 0.998 |
| -0.0319999999999982 | 1.001 | 1.002 | 1.003 | 0.999 | 0.998 |
| -0.0299999999999982 | 1.001 | 1.002 | 1.003 | 0.999 | 0.998 |
| -0.0279999999999982 | 1.001 | 1.002 | 1.002 | 0.999 | 0.998 |
| -0.0259999999999982 | 1.001 | 1.001 | 1.002 | 0.999 | 0.999 |
| -0.0239999999999982 | 1.001 | 1.001 | 1.002 | 0.999 | 0.999 |
| -0.0219999999999982 | 1 | 1.001 | 1.001 | 1 | 0.999 |
| -0.0199999999999982 | 1 | 1.001 | 1.001 | 1 | 0.999 |
| -0.0179999999999982 | 1 | 1.001 | 1.001 | 1 | 0.999 |
| -0.0159999999999982 | 1 | 1.001 | 1.001 | 1 | 0.999 |
| -0.0139999999999982 | 1 | 1 | 1.001 | 1 | 1 |
| -0.0119999999999982 | 1 | 1 | 1 | 1 | 1 |
| -0.00999999999999823 | 1 | 1 | 1 | 1 | 1 |
| -0.00799999999999824 | 1 | 1 | 1 | 1 | 1 |
| -0.00599999999999824 | 1 | 1 | 1 | 1 | 1 |
| -0.00399999999999824 | 1 | 1 | 1 | 1 | 1 |
| -0.00199999999999824 | 1 | 1 | 1 | 1 | 1 |
| 1.76247905159244e-15 | 1 | 1 | 1 | 1 | 1 |
| 0.00200000000000176 | 1 | 1 | 1 | 1 | 1 |
| 0.00400000000000176 | 1 | 1 | 1 | 1 | 1 |
| 0.00600000000000176 | 1 | 1 | 1 | 1 | 1 |
| 0.00800000000000176 | 1 | 1 | 1 | 1 | 1 |
| 0.0100000000000018 | 1 | 1 | 1 | 1 | 1 |
| 0.0120000000000018 | 1 | 1 | 1 | 1 | 1 |
| 0.0140000000000018 | 1 | 1 | 1.001 | 1 | 1 |
| 0.0160000000000018 | 1 | 1.001 | 1.001 | 1 | 0.999 |
| 0.0180000000000018 | 1 | 1.001 | 1.001 | 1 | 0.999 |
| 0.0200000000000018 | 1 | 1.001 | 1.001 | 1 | 0.999 |
| 0.0220000000000018 | 1 | 1.001 | 1.001 | 1 | 0.999 |
| 0.0240000000000018 | 1.001 | 1.001 | 1.002 | 0.999 | 0.999 |
| 0.0260000000000018 | 1.001 | 1.001 | 1.002 | 0.999 | 0.999 |
| 0.0280000000000018 | 1.001 | 1.002 | 1.002 | 0.999 | 0.998 |
| 0.0300000000000018 | 1.001 | 1.002 | 1.003 | 0.999 | 0.998 |
| 0.0320000000000018 | 1.001 | 1.002 | 1.003 | 0.999 | 0.998 |
| 0.0340000000000018 | 1.001 | 1.002 | 1.003 | 0.999 | 0.998 |
| 0.0360000000000018 | 1.001 | 1.003 | 1.004 | 0.999 | 0.997 |
| 0.0380000000000018 | 1.001 | 1.003 | 1.004 | 0.999 | 0.997 |
| 0.0400000000000018 | 1.002 | 1.003 | 1.005 | 0.998 | 0.997 |
| 0.0420000000000018 | 1.002 | 1.004 | 1.005 | 0.998 | 0.996 |
| 0.0440000000000018 | 1.002 | 1.004 | 1.006 | 0.998 | 0.996 |
| 0.0460000000000018 | 1.002 | 1.004 | 1.006 | 0.998 | 0.996 |
| 0.0480000000000018 | 1.002 | 1.005 | 1.007 | 0.998 | 0.995 |
| 0.0500000000000018 | 1.003 | 1.005 | 1.008 | 0.998 | 0.995 |
| 0.0520000000000018 | 1.003 | 1.005 | 1.008 | 0.997 | 0.995 |
| 0.0540000000000018 | 1.003 | 1.006 | 1.009 | 0.997 | 0.994 |
| 0.0560000000000018 | 1.003 | 1.006 | 1.009 | 0.997 | 0.994 |
| 0.0580000000000018 | 1.003 | 1.007 | 1.01 | 0.997 | 0.993 |
| 0.0600000000000018 | 1.004 | 1.007 | 1.011 | 0.996 | 0.993 |
| 0.0620000000000018 | 1.004 | 1.008 | 1.012 | 0.996 | 0.992 |
| 0.0640000000000018 | 1.004 | 1.008 | 1.012 | 0.996 | 0.992 |
| 0.0660000000000018 | 1.004 | 1.009 | 1.013 | 0.996 | 0.991 |
| 0.0680000000000018 | 1.005 | 1.009 | 1.014 | 0.995 | 0.991 |
| 0.0700000000000018 | 1.005 | 1.01 | 1.015 | 0.995 | 0.99 |
| 0.0720000000000018 | 1.005 | 1.01 | 1.016 | 0.995 | 0.99 |
| 0.0740000000000018 | 1.005 | 1.011 | 1.017 | 0.995 | 0.989 |
| 0.0760000000000018 | 1.006 | 1.012 | 1.017 | 0.994 | 0.989 |
| 0.0780000000000018 | 1.006 | 1.012 | 1.018 | 0.994 | 0.988 |
| 0.0800000000000018 | 1.006 | 1.013 | 1.019 | 0.994 | 0.987 |
| 0.0820000000000018 | 1.007 | 1.014 | 1.02 | 0.993 | 0.987 |
| 0.0840000000000018 | 1.007 | 1.014 | 1.021 | 0.993 | 0.986 |
| 0.0860000000000018 | 1.007 | 1.015 | 1.022 | 0.993 | 0.985 |
| 0.0880000000000018 | 1.008 | 1.016 | 1.024 | 0.992 | 0.985 |
| 0.0900000000000018 | 1.008 | 1.016 | 1.025 | 0.992 | 0.984 |
| 0.0920000000000018 | 1.008 | 1.017 | 1.026 | 0.992 | 0.983 |
| 0.0940000000000018 | 1.009 | 1.018 | 1.027 | 0.991 | 0.982 |
| 0.0960000000000018 | 1.009 | 1.019 | 1.028 | 0.991 | 0.982 |
| 0.0980000000000018 | 1.01 | 1.019 | 1.029 | 0.99 | 0.981 |
| 0.100000000000002 | 1.01 | 1.02 | 1.03 | 0.99 | 0.98 |
| 0.102000000000002 | 1.01 | 1.021 | 1.032 | 0.99 | 0.979 |
| 0.104000000000002 | 1.011 | 1.022 | 1.033 | 0.989 | 0.979 |
| 0.106000000000002 | 1.011 | 1.023 | 1.034 | 0.989 | 0.978 |
| 0.108000000000002 | 1.012 | 1.024 | 1.036 | 0.988 | 0.977 |
| 0.110000000000002 | 1.012 | 1.024 | 1.037 | 0.988 | 0.976 |
| 0.112000000000002 | 1.013 | 1.025 | 1.038 | 0.988 | 0.975 |
| 0.114000000000002 | 1.013 | 1.026 | 1.04 | 0.987 | 0.974 |
| 0.116000000000002 | 1.014 | 1.027 | 1.041 | 0.987 | 0.973 |
| 0.118000000000002 | 1.014 | 1.028 | 1.043 | 0.986 | 0.973 |
| 0.120000000000002 | 1.015 | 1.029 | 1.044 | 0.986 | 0.972 |
| 0.122000000000002 | 1.015 | 1.03 | 1.046 | 0.985 | 0.971 |
| 0.124000000000002 | 1.015 | 1.031 | 1.047 | 0.985 | 0.97 |
| 0.126000000000002 | 1.016 | 1.032 | 1.049 | 0.984 | 0.969 |
| 0.128000000000002 | 1.017 | 1.033 | 1.05 | 0.984 | 0.968 |
| 0.130000000000002 | 1.017 | 1.034 | 1.052 | 0.983 | 0.967 |
| 0.132000000000002 | 1.018 | 1.035 | 1.054 | 0.983 | 0.966 |
| 0.134000000000002 | 1.018 | 1.037 | 1.055 | 0.982 | 0.965 |
| 0.136000000000002 | 1.019 | 1.038 | 1.057 | 0.982 | 0.964 |
| 0.138000000000002 | 1.019 | 1.039 | 1.059 | 0.981 | 0.963 |
| 0.140000000000002 | 1.02 | 1.04 | 1.061 | 0.981 | 0.962 |
| 0.142000000000002 | 1.02 | 1.041 | 1.062 | 0.98 | 0.96 |
| 0.144000000000002 | 1.021 | 1.042 | 1.064 | 0.979 | 0.959 |
| 0.146000000000002 | 1.022 | 1.044 | 1.066 | 0.979 | 0.958 |
| 0.148000000000002 | 1.022 | 1.045 | 1.068 | 0.978 | 0.957 |
| 0.150000000000002 | 1.023 | 1.046 | 1.07 | 0.978 | 0.956 |
| 0.152000000000002 | 1.023 | 1.047 | 1.072 | 0.977 | 0.955 |
| 0.154000000000002 | 1.024 | 1.049 | 1.074 | 0.977 | 0.954 |
| 0.156000000000002 | 1.025 | 1.05 | 1.076 | 0.976 | 0.952 |
| 0.158000000000002 | 1.025 | 1.051 | 1.078 | 0.975 | 0.951 |
| 0.160000000000002 | 1.026 | 1.053 | 1.08 | 0.975 | 0.95 |
| 0.162000000000002 | 1.027 | 1.054 | 1.082 | 0.974 | 0.949 |
| 0.164000000000002 | 1.027 | 1.055 | 1.084 | 0.973 | 0.948 |
| 0.166000000000002 | 1.028 | 1.057 | 1.086 | 0.973 | 0.946 |
| 0.168000000000002 | 1.029 | 1.058 | 1.088 | 0.972 | 0.945 |
| 0.170000000000002 | 1.029 | 1.06 | 1.091 | 0.972 | 0.944 |
| 0.172000000000002 | 1.03 | 1.061 | 1.093 | 0.971 | 0.943 |
| 0.174000000000002 | 1.031 | 1.062 | 1.095 | 0.97 | 0.941 |
| 0.176000000000002 | 1.031 | 1.064 | 1.097 | 0.969 | 0.94 |
| 0.178000000000002 | 1.032 | 1.065 | 1.1 | 0.969 | 0.939 |
| 0.180000000000002 | 1.033 | 1.067 | 1.102 | 0.968 | 0.937 |
| 0.182000000000002 | 1.034 | 1.068 | 1.104 | 0.967 | 0.936 |
| 0.184000000000002 | 1.034 | 1.07 | 1.107 | 0.967 | 0.935 |
| 0.186000000000002 | 1.035 | 1.072 | 1.109 | 0.966 | 0.933 |
| 0.188000000000002 | 1.036 | 1.073 | 1.112 | 0.965 | 0.932 |
| 0.190000000000002 | 1.037 | 1.075 | 1.114 | 0.965 | 0.93 |
| 0.192000000000002 | 1.038 | 1.077 | 1.117 | 0.964 | 0.929 |
| 0.194000000000002 | 1.038 | 1.078 | 1.12 | 0.963 | 0.927 |
| 0.196000000000002 | 1.039 | 1.08 | 1.122 | 0.962 | 0.926 |
| 0.198000000000002 | 1.04 | 1.082 | 1.125 | 0.962 | 0.925 |
| 0.200000000000002 | 1.041 | 1.083 | 1.127 | 0.961 | 0.923 |
| 0.202000000000002 | 1.042 | 1.085 | 1.13 | 0.96 | 0.922 |
| 0.204000000000002 | 1.042 | 1.087 | 1.133 | 0.959 | 0.92 |
| 0.206000000000002 | 1.043 | 1.089 | 1.136 | 0.958 | 0.919 |
| 0.208000000000002 | 1.044 | 1.09 | 1.139 | 0.958 | 0.917 |
| 0.210000000000002 | 1.045 | 1.092 | 1.141 | 0.957 | 0.916 |
| 0.212000000000002 | 1.046 | 1.094 | 1.144 | 0.956 | 0.914 |
| 0.214000000000002 | 1.047 | 1.096 | 1.147 | 0.955 | 0.912 |
| 0.216000000000002 | 1.048 | 1.098 | 1.15 | 0.954 | 0.911 |
| 0.218000000000002 | 1.049 | 1.1 | 1.153 | 0.954 | 0.909 |
| 0.220000000000002 | 1.05 | 1.102 | 1.156 | 0.953 | 0.908 |
| 0.222000000000002 | 1.051 | 1.104 | 1.159 | 0.952 | 0.906 |
| 0.224000000000002 | 1.051 | 1.106 | 1.162 | 0.951 | 0.905 |
| 0.226000000000002 | 1.052 | 1.108 | 1.166 | 0.95 | 0.903 |
| 0.228000000000002 | 1.053 | 1.11 | 1.169 | 0.949 | 0.901 |
| 0.230000000000002 | 1.054 | 1.112 | 1.172 | 0.948 | 0.9 |
| 0.232000000000002 | 1.055 | 1.114 | 1.175 | 0.948 | 0.898 |
| 0.234000000000002 | 1.056 | 1.116 | 1.179 | 0.947 | 0.896 |
| 0.236000000000002 | 1.057 | 1.118 | 1.182 | 0.946 | 0.895 |
| 0.238000000000002 | 1.058 | 1.12 | 1.185 | 0.945 | 0.893 |
| 0.240000000000002 | 1.059 | 1.122 | 1.189 | 0.944 | 0.891 |
| 0.242000000000002 | 1.06 | 1.124 | 1.192 | 0.943 | 0.889 |
| 0.244000000000002 | 1.061 | 1.126 | 1.196 | 0.942 | 0.888 |
| 0.246000000000002 | 1.062 | 1.129 | 1.199 | 0.941 | 0.886 |
| 0.248000000000002 | 1.063 | 1.131 | 1.203 | 0.94 | 0.884 |
| 0.250000000000002 | 1.064 | 1.133 | 1.206 | 0.939 | 0.882 |
| 0.252000000000002 | 1.066 | 1.135 | 1.21 | 0.938 | 0.881 |
| 0.254000000000002 | 1.067 | 1.138 | 1.214 | 0.938 | 0.879 |
| 0.256000000000002 | 1.068 | 1.14 | 1.217 | 0.937 | 0.877 |
| 0.258000000000002 | 1.069 | 1.142 | 1.221 | 0.936 | 0.875 |
| 0.260000000000002 | 1.07 | 1.145 | 1.225 | 0.935 | 0.874 |
| 0.262000000000002 | 1.071 | 1.147 | 1.229 | 0.934 | 0.872 |
| 0.264000000000002 | 1.072 | 1.15 | 1.233 | 0.933 | 0.87 |
| 0.266000000000002 | 1.073 | 1.152 | 1.236 | 0.932 | 0.868 |
| 0.268000000000002 | 1.074 | 1.154 | 1.24 | 0.931 | 0.866 |
| 0.270000000000002 | 1.076 | 1.157 | 1.244 | 0.93 | 0.864 |
| 0.272000000000002 | 1.077 | 1.159 | 1.249 | 0.929 | 0.862 |
| 0.274000000000002 | 1.078 | 1.162 | 1.253 | 0.928 | 0.861 |
| 0.276000000000002 | 1.079 | 1.165 | 1.257 | 0.927 | 0.859 |
| 0.278000000000002 | 1.08 | 1.167 | 1.261 | 0.926 | 0.857 |
| 0.280000000000002 | 1.082 | 1.17 | 1.265 | 0.925 | 0.855 |
| 0.282000000000002 | 1.083 | 1.172 | 1.269 | 0.924 | 0.853 |
| 0.284000000000002 | 1.084 | 1.175 | 1.274 | 0.923 | 0.851 |
| 0.286000000000002 | 1.085 | 1.178 | 1.278 | 0.921 | 0.849 |
| 0.288000000000002 | 1.086 | 1.18 | 1.283 | 0.92 | 0.847 |
| 0.290000000000002 | 1.088 | 1.183 | 1.287 | 0.919 | 0.845 |
| 0.292000000000002 | 1.089 | 1.186 | 1.291 | 0.918 | 0.843 |
| 0.294000000000002 | 1.09 | 1.189 | 1.296 | 0.917 | 0.841 |
| 0.296000000000002 | 1.092 | 1.192 | 1.301 | 0.916 | 0.839 |
| 0.298000000000002 | 1.093 | 1.194 | 1.305 | 0.915 | 0.837 |
| 0.300000000000002 | 1.094 | 1.197 | 1.31 | 0.914 | 0.835 |
| 0.302000000000002 | 1.095 | 1.2 | 1.315 | 0.913 | 0.833 |
| 0.304000000000002 | 1.097 | 1.203 | 1.319 | 0.912 | 0.831 |
| 0.306000000000002 | 1.098 | 1.206 | 1.324 | 0.911 | 0.829 |
| 0.308000000000002 | 1.1 | 1.209 | 1.329 | 0.909 | 0.827 |
| 0.310000000000002 | 1.101 | 1.212 | 1.334 | 0.908 | 0.825 |
| 0.312000000000002 | 1.102 | 1.215 | 1.339 | 0.907 | 0.823 |
| 0.314000000000002 | 1.104 | 1.218 | 1.344 | 0.906 | 0.821 |
| 0.316000000000002 | 1.105 | 1.221 | 1.349 | 0.905 | 0.819 |
| 0.318000000000002 | 1.106 | 1.224 | 1.354 | 0.904 | 0.817 |
| 0.320000000000002 | 1.108 | 1.227 | 1.36 | 0.903 | 0.815 |
| 0.322000000000002 | 1.109 | 1.23 | 1.365 | 0.902 | 0.813 |
| 0.324000000000002 | 1.111 | 1.234 | 1.37 | 0.9 | 0.811 |
| 0.326000000000002 | 1.112 | 1.237 | 1.376 | 0.899 | 0.809 |
| 0.328000000000002 | 1.114 | 1.24 | 1.381 | 0.898 | 0.806 |
| 0.330000000000002 | 1.115 | 1.243 | 1.386 | 0.897 | 0.804 |
| 0.332000000000002 | 1.117 | 1.247 | 1.392 | 0.896 | 0.802 |
| 0.334000000000002 | 1.118 | 1.25 | 1.397 | 0.894 | 0.8 |
| 0.336000000000002 | 1.12 | 1.253 | 1.403 | 0.893 | 0.798 |
| 0.338000000000002 | 1.121 | 1.257 | 1.409 | 0.892 | 0.796 |
| 0.340000000000002 | 1.123 | 1.26 | 1.415 | 0.891 | 0.794 |
| 0.342000000000002 | 1.124 | 1.264 | 1.42 | 0.89 | 0.791 |
| 0.344000000000002 | 1.126 | 1.267 | 1.426 | 0.888 | 0.789 |
| 0.346000000000002 | 1.127 | 1.271 | 1.432 | 0.887 | 0.787 |
| 0.348000000000002 | 1.129 | 1.274 | 1.438 | 0.886 | 0.785 |
| 0.350000000000002 | 1.13 | 1.278 | 1.444 | 0.885 | 0.783 |
| 0.352000000000002 | 1.132 | 1.281 | 1.45 | 0.883 | 0.781 |
| 0.354000000000002 | 1.134 | 1.285 | 1.456 | 0.882 | 0.778 |
| 0.356000000000002 | 1.135 | 1.288 | 1.463 | 0.881 | 0.776 |
| 0.358000000000002 | 1.137 | 1.292 | 1.469 | 0.88 | 0.774 |
| 0.360000000000002 | 1.138 | 1.296 | 1.475 | 0.878 | 0.772 |
| 0.362000000000002 | 1.14 | 1.3 | 1.482 | 0.877 | 0.769 |
| 0.364000000000002 | 1.142 | 1.303 | 1.488 | 0.876 | 0.767 |
| 0.366000000000002 | 1.143 | 1.307 | 1.495 | 0.875 | 0.765 |
| 0.368000000000002 | 1.145 | 1.311 | 1.501 | 0.873 | 0.763 |
| 0.370000000000002 | 1.147 | 1.315 | 1.508 | 0.872 | 0.76 |
| 0.372000000000002 | 1.148 | 1.319 | 1.515 | 0.871 | 0.758 |
| 0.374000000000002 | 1.15 | 1.323 | 1.521 | 0.869 | 0.756 |
| 0.376000000000002 | 1.152 | 1.327 | 1.528 | 0.868 | 0.754 |
| 0.378000000000002 | 1.154 | 1.331 | 1.535 | 0.867 | 0.751 |
| 0.380000000000002 | 1.155 | 1.335 | 1.542 | 0.866 | 0.749 |
| 0.382000000000002 | 1.157 | 1.339 | 1.549 | 0.864 | 0.747 |
| 0.384000000000002 | 1.159 | 1.343 | 1.556 | 0.863 | 0.745 |
| 0.386000000000002 | 1.161 | 1.347 | 1.564 | 0.862 | 0.742 |
| 0.388000000000002 | 1.162 | 1.351 | 1.571 | 0.86 | 0.74 |
| 0.390000000000002 | 1.164 | 1.356 | 1.578 | 0.859 | 0.738 |
| 0.392000000000002 | 1.166 | 1.36 | 1.586 | 0.858 | 0.735 |
| 0.394000000000002 | 1.168 | 1.364 | 1.593 | 0.856 | 0.733 |
| 0.396000000000002 | 1.17 | 1.368 | 1.601 | 0.855 | 0.731 |
| 0.398000000000002 | 1.172 | 1.373 | 1.608 | 0.854 | 0.728 |
| 0.400000000000002 | 1.174 | 1.377 | 1.616 | 0.852 | 0.726 |
| 0.402000000000002 | 1.175 | 1.382 | 1.624 | 0.851 | 0.724 |
| 0.404000000000002 | 1.177 | 1.386 | 1.632 | 0.849 | 0.721 |
| 0.406000000000002 | 1.179 | 1.391 | 1.64 | 0.848 | 0.719 |
| 0.408000000000002 | 1.181 | 1.395 | 1.648 | 0.847 | 0.717 |
| 0.410000000000002 | 1.183 | 1.4 | 1.656 | 0.845 | 0.714 |
| 0.412000000000002 | 1.185 | 1.404 | 1.664 | 0.844 | 0.712 |
| 0.414000000000002 | 1.187 | 1.409 | 1.672 | 0.842 | 0.71 |
| 0.416000000000002 | 1.189 | 1.414 | 1.681 | 0.841 | 0.707 |
| 0.418000000000002 | 1.191 | 1.418 | 1.689 | 0.84 | 0.705 |
| 0.420000000000002 | 1.193 | 1.423 | 1.698 | 0.838 | 0.703 |
| 0.422000000000002 | 1.195 | 1.428 | 1.706 | 0.837 | 0.7 |
| 0.424000000000002 | 1.197 | 1.433 | 1.715 | 0.835 | 0.698 |
| 0.426000000000002 | 1.199 | 1.438 | 1.724 | 0.834 | 0.696 |
| 0.428000000000002 | 1.201 | 1.442 | 1.732 | 0.833 | 0.693 |
| 0.430000000000002 | 1.203 | 1.447 | 1.741 | 0.831 | 0.691 |
| 0.432000000000002 | 1.205 | 1.452 | 1.75 | 0.83 | 0.688 |
| 0.434000000000002 | 1.207 | 1.457 | 1.76 | 0.828 | 0.686 |
| 0.436000000000002 | 1.209 | 1.463 | 1.769 | 0.827 | 0.684 |
| 0.438000000000002 | 1.211 | 1.468 | 1.778 | 0.825 | 0.681 |
| 0.440000000000002 | 1.214 | 1.473 | 1.787 | 0.824 | 0.679 |
| 0.442000000000002 | 1.216 | 1.478 | 1.797 | 0.823 | 0.677 |
| 0.444000000000002 | 1.218 | 1.483 | 1.807 | 0.821 | 0.674 |
| 0.446000000000002 | 1.22 | 1.489 | 1.816 | 0.82 | 0.672 |
| 0.448000000000002 | 1.222 | 1.494 | 1.826 | 0.818 | 0.669 |
| 0.450000000000002 | 1.224 | 1.499 | 1.836 | 0.817 | 0.667 |
| 0.452000000000002 | 1.227 | 1.505 | 1.846 | 0.815 | 0.665 |
| 0.454000000000002 | 1.229 | 1.51 | 1.856 | 0.814 | 0.662 |
| 0.456000000000002 | 1.231 | 1.516 | 1.866 | 0.812 | 0.66 |
| 0.458000000000002 | 1.233 | 1.521 | 1.876 | 0.811 | 0.657 |
| 0.460000000000002 | 1.236 | 1.527 | 1.887 | 0.809 | 0.655 |
| 0.462000000000002 | 1.238 | 1.532 | 1.897 | 0.808 | 0.653 |
| 0.464000000000002 | 1.24 | 1.538 | 1.908 | 0.806 | 0.65 |
| 0.466000000000002 | 1.243 | 1.544 | 1.918 | 0.805 | 0.648 |
| 0.468000000000002 | 1.245 | 1.55 | 1.929 | 0.803 | 0.645 |
| 0.470000000000002 | 1.247 | 1.556 | 1.94 | 0.802 | 0.643 |
| 0.472000000000002 | 1.25 | 1.561 | 1.951 | 0.8 | 0.64 |
| 0.474000000000002 | 1.252 | 1.567 | 1.962 | 0.799 | 0.638 |
| 0.476000000000002 | 1.254 | 1.573 | 1.973 | 0.797 | 0.636 |
| 0.478000000000002 | 1.257 | 1.579 | 1.985 | 0.796 | 0.633 |
| 0.480000000000002 | 1.259 | 1.585 | 1.996 | 0.794 | 0.631 |
| 0.482000000000002 | 1.262 | 1.591 | 2.008 | 0.793 | 0.628 |
| 0.484000000000002 | 1.264 | 1.598 | 2.019 | 0.791 | 0.626 |
| 0.486000000000002 | 1.266 | 1.604 | 2.031 | 0.79 | 0.624 |
| 0.488000000000002 | 1.269 | 1.61 | 2.043 | 0.788 | 0.621 |
| 0.490000000000002 | 1.271 | 1.616 | 2.055 | 0.787 | 0.619 |
| 0.492000000000002 | 1.274 | 1.623 | 2.067 | 0.785 | 0.616 |
| 0.494000000000002 | 1.276 | 1.629 | 2.079 | 0.783 | 0.614 |
| 0.496000000000002 | 1.279 | 1.636 | 2.092 | 0.782 | 0.611 |
| 0.498000000000002 | 1.281 | 1.642 | 2.104 | 0.78 | 0.609 |
| 0.500000000000002 | 1.284 | 1.649 | 2.117 | 0.779 | 0.607 |
| 0.502000000000002 | 1.287 | 1.655 | 2.13 | 0.777 | 0.604 |
| 0.504000000000002 | 1.289 | 1.662 | 2.143 | 0.776 | 0.602 |
| 0.506000000000002 | 1.292 | 1.669 | 2.156 | 0.774 | 0.599 |
| 0.508000000000002 | 1.294 | 1.676 | 2.169 | 0.773 | 0.597 |
| 0.510000000000002 | 1.297 | 1.682 | 2.182 | 0.771 | 0.594 |
| 0.512000000000002 | 1.3 | 1.689 | 2.196 | 0.769 | 0.592 |
| 0.514000000000002 | 1.302 | 1.696 | 2.209 | 0.768 | 0.59 |
| 0.516000000000002 | 1.305 | 1.703 | 2.223 | 0.766 | 0.587 |
| 0.518000000000002 | 1.308 | 1.71 | 2.237 | 0.765 | 0.585 |
| 0.520000000000002 | 1.31 | 1.717 | 2.251 | 0.763 | 0.582 |
| 0.522000000000002 | 1.313 | 1.725 | 2.265 | 0.761 | 0.58 |
| 0.524000000000002 | 1.316 | 1.732 | 2.279 | 0.76 | 0.577 |
| 0.526000000000002 | 1.319 | 1.739 | 2.293 | 0.758 | 0.575 |
| 0.528000000000002 | 1.322 | 1.746 | 2.308 | 0.757 | 0.573 |
| 0.530000000000002 | 1.324 | 1.754 | 2.323 | 0.755 | 0.57 |
| 0.532000000000002 | 1.327 | 1.761 | 2.337 | 0.754 | 0.568 |
| 0.534000000000002 | 1.33 | 1.769 | 2.352 | 0.752 | 0.565 |
| 0.536000000000002 | 1.333 | 1.776 | 2.368 | 0.75 | 0.563 |
| 0.538000000000002 | 1.336 | 1.784 | 2.383 | 0.749 | 0.561 |
| 0.540000000000002 | 1.339 | 1.792 | 2.398 | 0.747 | 0.558 |
| 0.542000000000002 | 1.341 | 1.8 | 2.414 | 0.745 | 0.556 |
| 0.544000000000002 | 1.344 | 1.807 | 2.43 | 0.744 | 0.553 |
| 0.546000000000002 | 1.347 | 1.815 | 2.446 | 0.742 | 0.551 |
| 0.548000000000002 | 1.35 | 1.823 | 2.462 | 0.741 | 0.548 |
| 0.550000000000002 | 1.353 | 1.831 | 2.478 | 0.739 | 0.546 |
| 0.552000000000002 | 1.356 | 1.839 | 2.495 | 0.737 | 0.544 |
| 0.554000000000002 | 1.359 | 1.847 | 2.511 | 0.736 | 0.541 |
| 0.556000000000002 | 1.362 | 1.856 | 2.528 | 0.734 | 0.539 |
| 0.558000000000002 | 1.365 | 1.864 | 2.545 | 0.732 | 0.536 |
| 0.560000000000002 | 1.368 | 1.872 | 2.562 | 0.731 | 0.534 |
| 0.562000000000002 | 1.371 | 1.881 | 2.579 | 0.729 | 0.532 |
| 0.564000000000002 | 1.375 | 1.889 | 2.597 | 0.728 | 0.529 |
| 0.566000000000002 | 1.378 | 1.898 | 2.614 | 0.726 | 0.527 |
| 0.568000000000002 | 1.381 | 1.906 | 2.632 | 0.724 | 0.525 |
| 0.570000000000002 | 1.384 | 1.915 | 2.65 | 0.723 | 0.522 |
| 0.572000000000002 | 1.387 | 1.924 | 2.669 | 0.721 | 0.52 |
| 0.574000000000002 | 1.39 | 1.933 | 2.687 | 0.719 | 0.517 |
| 0.576000000000002 | 1.393 | 1.942 | 2.706 | 0.718 | 0.515 |
| 0.578000000000002 | 1.397 | 1.951 | 2.724 | 0.716 | 0.513 |
| 0.580000000000002 | 1.4 | 1.96 | 2.743 | 0.714 | 0.51 |
| 0.582000000000002 | 1.403 | 1.969 | 2.763 | 0.713 | 0.508 |
| 0.584000000000002 | 1.406 | 1.978 | 2.782 | 0.711 | 0.506 |
| 0.586000000000002 | 1.41 | 1.987 | 2.802 | 0.709 | 0.503 |
| 0.588000000000002 | 1.413 | 1.997 | 2.821 | 0.708 | 0.501 |
| 0.590000000000002 | 1.416 | 2.006 | 2.841 | 0.706 | 0.498 |
| 0.592000000000002 | 1.42 | 2.016 | 2.862 | 0.704 | 0.496 |
| 0.594000000000002 | 1.423 | 2.025 | 2.882 | 0.703 | 0.494 |
| 0.596000000000002 | 1.426 | 2.035 | 2.903 | 0.701 | 0.491 |
| 0.598000000000002 | 1.43 | 2.045 | 2.924 | 0.699 | 0.489 |
| 0.600000000000002 | 1.433 | 2.054 | 2.945 | 0.698 | 0.487 |
| 0.602000000000002 | 1.437 | 2.064 | 2.966 | 0.696 | 0.484 |
| 0.604000000000002 | 1.44 | 2.074 | 2.988 | 0.694 | 0.482 |
| 0.606000000000002 | 1.444 | 2.084 | 3.009 | 0.693 | 0.48 |
| 0.608000000000002 | 1.447 | 2.095 | 3.031 | 0.691 | 0.477 |
| 0.610000000000002 | 1.451 | 2.105 | 3.054 | 0.689 | 0.475 |
| 0.612000000000002 | 1.454 | 2.115 | 3.076 | 0.688 | 0.473 |
| 0.614000000000002 | 1.458 | 2.125 | 3.099 | 0.686 | 0.47 |
| 0.616000000000002 | 1.461 | 2.136 | 3.122 | 0.684 | 0.468 |
| 0.618000000000002 | 1.465 | 2.147 | 3.145 | 0.683 | 0.466 |
| 0.620000000000002 | 1.469 | 2.157 | 3.168 | 0.681 | 0.464 |
| 0.622000000000002 | 1.472 | 2.168 | 3.192 | 0.679 | 0.461 |
| 0.624000000000002 | 1.476 | 2.179 | 3.216 | 0.677 | 0.459 |
| 0.626000000000002 | 1.48 | 2.19 | 3.24 | 0.676 | 0.457 |
| 0.628000000000002 | 1.483 | 2.201 | 3.265 | 0.674 | 0.454 |
| 0.630000000000002 | 1.487 | 2.212 | 3.289 | 0.672 | 0.452 |
| 0.632000000000002 | 1.491 | 2.223 | 3.314 | 0.671 | 0.45 |
| 0.634000000000002 | 1.495 | 2.234 | 3.34 | 0.669 | 0.448 |
| 0.636000000000002 | 1.499 | 2.246 | 3.365 | 0.667 | 0.445 |
| 0.638000000000002 | 1.502 | 2.257 | 3.391 | 0.666 | 0.443 |
| 0.640000000000002 | 1.506 | 2.269 | 3.417 | 0.664 | 0.441 |
| 0.642000000000002 | 1.51 | 2.28 | 3.444 | 0.662 | 0.439 |
| 0.644000000000002 | 1.514 | 2.292 | 3.47 | 0.661 | 0.436 |
| 0.646000000000002 | 1.518 | 2.304 | 3.497 | 0.659 | 0.434 |
| 0.648000000000002 | 1.522 | 2.316 | 3.524 | 0.657 | 0.432 |
| 0.650000000000002 | 1.526 | 2.328 | 3.552 | 0.655 | 0.43 |
| 0.652000000000002 | 1.53 | 2.34 | 3.58 | 0.654 | 0.427 |
| 0.654000000000002 | 1.534 | 2.352 | 3.608 | 0.652 | 0.425 |
| 0.656000000000002 | 1.538 | 2.365 | 3.636 | 0.65 | 0.423 |
| 0.658000000000002 | 1.542 | 2.377 | 3.665 | 0.649 | 0.421 |
| 0.660000000000002 | 1.546 | 2.39 | 3.694 | 0.647 | 0.418 |
| 0.662000000000002 | 1.55 | 2.402 | 3.724 | 0.645 | 0.416 |
| 0.664000000000002 | 1.554 | 2.415 | 3.753 | 0.643 | 0.414 |
| 0.666000000000002 | 1.558 | 2.428 | 3.784 | 0.642 | 0.412 |
| 0.668000000000002 | 1.562 | 2.441 | 3.814 | 0.64 | 0.41 |
| 0.670000000000002 | 1.567 | 2.454 | 3.845 | 0.638 | 0.407 |
| 0.672000000000002 | 1.571 | 2.467 | 3.876 | 0.637 | 0.405 |
| 0.674000000000002 | 1.575 | 2.481 | 3.907 | 0.635 | 0.403 |
| 0.676000000000002 | 1.579 | 2.494 | 3.939 | 0.633 | 0.401 |
| 0.678000000000002 | 1.584 | 2.508 | 3.971 | 0.631 | 0.399 |
| 0.680000000000002 | 1.588 | 2.521 | 4.004 | 0.63 | 0.397 |
| 0.682000000000002 | 1.592 | 2.535 | 4.036 | 0.628 | 0.394 |
| 0.684000000000002 | 1.597 | 2.549 | 4.07 | 0.626 | 0.392 |
| 0.686000000000002 | 1.601 | 2.563 | 4.103 | 0.625 | 0.39 |
| 0.688000000000002 | 1.605 | 2.577 | 4.137 | 0.623 | 0.388 |
| 0.690000000000002 | 1.61 | 2.591 | 4.172 | 0.621 | 0.386 |
| 0.692000000000002 | 1.614 | 2.606 | 4.206 | 0.619 | 0.384 |
| 0.694000000000002 | 1.619 | 2.62 | 4.241 | 0.618 | 0.382 |
| 0.696000000000002 | 1.623 | 2.635 | 4.277 | 0.616 | 0.38 |
| 0.698000000000002 | 1.628 | 2.65 | 4.313 | 0.614 | 0.377 |
| 0.700000000000002 | 1.632 | 2.664 | 4.349 | 0.613 | 0.375 |
| 0.702000000000002 | 1.637 | 2.679 | 4.386 | 0.611 | 0.373 |
| 0.704000000000002 | 1.642 | 2.695 | 4.423 | 0.609 | 0.371 |
| 0.706000000000002 | 1.646 | 2.71 | 4.461 | 0.607 | 0.369 |
| 0.708000000000002 | 1.651 | 2.725 | 4.499 | 0.606 | 0.367 |
| 0.710000000000002 | 1.655 | 2.741 | 4.537 | 0.604 | 0.365 |
| 0.712000000000002 | 1.66 | 2.756 | 4.576 | 0.602 | 0.363 |
| 0.714000000000002 | 1.665 | 2.772 | 4.615 | 0.601 | 0.361 |
| 0.716000000000002 | 1.67 | 2.788 | 4.655 | 0.599 | 0.359 |
| 0.718000000000002 | 1.675 | 2.804 | 4.695 | 0.597 | 0.357 |
| 0.720000000000002 | 1.679 | 2.82 | 4.736 | 0.595 | 0.355 |
| 0.722000000000002 | 1.684 | 2.836 | 4.777 | 0.594 | 0.353 |
| 0.724000000000002 | 1.689 | 2.853 | 4.819 | 0.592 | 0.351 |
| 0.726000000000002 | 1.694 | 2.87 | 4.861 | 0.59 | 0.348 |
| 0.728000000000002 | 1.699 | 2.886 | 4.904 | 0.589 | 0.346 |
| 0.730000000000002 | 1.704 | 2.903 | 4.947 | 0.587 | 0.344 |
| 0.732000000000002 | 1.709 | 2.92 | 4.99 | 0.585 | 0.342 |
| 0.734000000000002 | 1.714 | 2.937 | 5.034 | 0.583 | 0.34 |
| 0.736000000000002 | 1.719 | 2.955 | 5.079 | 0.582 | 0.338 |
| 0.738000000000002 | 1.724 | 2.972 | 5.124 | 0.58 | 0.336 |
| 0.740000000000002 | 1.729 | 2.99 | 5.17 | 0.578 | 0.334 |
| 0.742000000000002 | 1.734 | 3.008 | 5.216 | 0.577 | 0.332 |
| 0.744000000000002 | 1.739 | 3.025 | 5.263 | 0.575 | 0.331 |
| 0.746000000000002 | 1.745 | 3.044 | 5.31 | 0.573 | 0.329 |
| 0.748000000000002 | 1.75 | 3.062 | 5.358 | 0.571 | 0.327 |
| 0.750000000000002 | 1.755 | 3.08 | 5.406 | 0.57 | 0.325 |
| 0.752000000000002 | 1.76 | 3.099 | 5.455 | 0.568 | 0.323 |
| 0.754000000000002 | 1.766 | 3.118 | 5.504 | 0.566 | 0.321 |
| 0.756000000000002 | 1.771 | 3.136 | 5.554 | 0.565 | 0.319 |
| 0.758000000000002 | 1.776 | 3.155 | 5.605 | 0.563 | 0.317 |
| 0.760000000000002 | 1.782 | 3.175 | 5.656 | 0.561 | 0.315 |
| 0.762000000000002 | 1.787 | 3.194 | 5.708 | 0.56 | 0.313 |
| 0.764000000000002 | 1.793 | 3.214 | 5.761 | 0.558 | 0.311 |
| 0.766000000000002 | 1.798 | 3.233 | 5.814 | 0.556 | 0.309 |
| 0.768000000000002 | 1.804 | 3.253 | 5.868 | 0.554 | 0.307 |
| 0.770000000000002 | 1.809 | 3.273 | 5.922 | 0.553 | 0.306 |
| 0.772000000000002 | 1.815 | 3.294 | 5.977 | 0.551 | 0.304 |
| 0.774000000000002 | 1.82 | 3.314 | 6.033 | 0.549 | 0.302 |
| 0.776000000000002 | 1.826 | 3.335 | 6.089 | 0.548 | 0.3 |
| 0.778000000000002 | 1.832 | 3.355 | 6.146 | 0.546 | 0.298 |
| 0.780000000000002 | 1.837 | 3.376 | 6.204 | 0.544 | 0.296 |
| 0.782000000000002 | 1.843 | 3.398 | 6.262 | 0.543 | 0.294 |
| 0.784000000000002 | 1.849 | 3.419 | 6.322 | 0.541 | 0.292 |
| 0.786000000000002 | 1.855 | 3.44 | 6.381 | 0.539 | 0.291 |
| 0.788000000000002 | 1.861 | 3.462 | 6.442 | 0.537 | 0.289 |
| 0.790000000000002 | 1.867 | 3.484 | 6.503 | 0.536 | 0.287 |
| 0.792000000000002 | 1.872 | 3.506 | 6.565 | 0.534 | 0.285 |
| 0.794000000000002 | 1.878 | 3.528 | 6.628 | 0.532 | 0.283 |
| 0.796000000000002 | 1.884 | 3.551 | 6.692 | 0.531 | 0.282 |
| 0.798000000000002 | 1.89 | 3.574 | 6.756 | 0.529 | 0.28 |
| 0.800000000000002 | 1.896 | 3.597 | 6.821 | 0.527 | 0.278 |
| 0.802000000000002 | 1.903 | 3.62 | 6.887 | 0.526 | 0.276 |
| 0.804000000000002 | 1.909 | 3.643 | 6.954 | 0.524 | 0.274 |
| 0.806000000000002 | 1.915 | 3.667 | 7.021 | 0.522 | 0.273 |
| 0.808000000000002 | 1.921 | 3.69 | 7.089 | 0.521 | 0.271 |
| 0.810000000000002 | 1.927 | 3.714 | 7.158 | 0.519 | 0.269 |
| 0.812000000000002 | 1.934 | 3.739 | 7.229 | 0.517 | 0.267 |
| 0.814000000000002 | 1.94 | 3.763 | 7.299 | 0.516 | 0.266 |
| 0.816000000000002 | 1.946 | 3.788 | 7.371 | 0.514 | 0.264 |
| 0.818000000000002 | 1.953 | 3.812 | 7.444 | 0.512 | 0.262 |
| 0.820000000000002 | 1.959 | 3.837 | 7.517 | 0.51 | 0.261 |
| 0.822000000000002 | 1.965 | 3.863 | 7.592 | 0.509 | 0.259 |
| 0.824000000000002 | 1.972 | 3.888 | 7.667 | 0.507 | 0.257 |
| 0.826000000000002 | 1.978 | 3.914 | 7.743 | 0.505 | 0.255 |
| 0.828000000000002 | 1.985 | 3.94 | 7.821 | 0.504 | 0.254 |
| 0.830000000000002 | 1.992 | 3.966 | 7.899 | 0.502 | 0.252 |
| 0.832000000000002 | 1.998 | 3.993 | 7.978 | 0.5 | 0.25 |
| 0.834000000000002 | 2.005 | 4.019 | 8.058 | 0.499 | 0.249 |
| 0.836000000000002 | 2.012 | 4.046 | 8.139 | 0.497 | 0.247 |
| 0.838000000000002 | 2.018 | 4.073 | 8.221 | 0.495 | 0.245 |
| 0.840000000000002 | 2.025 | 4.101 | 8.305 | 0.494 | 0.244 |
| 0.842000000000002 | 2.032 | 4.129 | 8.389 | 0.492 | 0.242 |
| 0.844000000000002 | 2.039 | 4.156 | 8.474 | 0.49 | 0.241 |
| 0.846000000000002 | 2.046 | 4.185 | 8.56 | 0.489 | 0.239 |
| 0.848000000000002 | 2.053 | 4.213 | 8.648 | 0.487 | 0.237 |
| 0.850000000000002 | 2.06 | 4.242 | 8.736 | 0.486 | 0.236 |
| 0.852000000000002 | 2.067 | 4.271 | 8.826 | 0.484 | 0.234 |
| 0.854000000000002 | 2.074 | 4.3 | 8.917 | 0.482 | 0.233 |
| 0.856000000000002 | 2.081 | 4.33 | 9.009 | 0.481 | 0.231 |
| 0.858000000000002 | 2.088 | 4.359 | 9.102 | 0.479 | 0.229 |
| 0.860000000000002 | 2.095 | 4.389 | 9.196 | 0.477 | 0.228 |
| 0.862000000000002 | 2.102 | 4.42 | 9.292 | 0.476 | 0.226 |
| 0.864000000000002 | 2.11 | 4.45 | 9.389 | 0.474 | 0.225 |
| 0.866000000000002 | 2.117 | 4.481 | 9.486 | 0.472 | 0.223 |
| 0.868000000000002 | 2.124 | 4.512 | 9.586 | 0.471 | 0.222 |
| 0.870000000000002 | 2.132 | 4.544 | 9.686 | 0.469 | 0.22 |
| 0.872000000000002 | 2.139 | 4.576 | 9.788 | 0.467 | 0.219 |
| 0.874000000000002 | 2.147 | 4.608 | 9.891 | 0.466 | 0.217 |
| 0.876000000000002 | 2.154 | 4.64 | 9.995 | 0.464 | 0.216 |
| 0.878000000000002 | 2.162 | 4.673 | 10.101 | 0.463 | 0.214 |
| 0.880000000000002 | 2.169 | 4.706 | 10.208 | 0.461 | 0.213 |
| 0.882000000000002 | 2.177 | 4.739 | 10.317 | 0.459 | 0.211 |
| 0.884000000000002 | 2.185 | 4.773 | 10.427 | 0.458 | 0.21 |
| 0.886000000000002 | 2.192 | 4.807 | 10.538 | 0.456 | 0.208 |
| 0.888000000000002 | 2.2 | 4.841 | 10.651 | 0.455 | 0.207 |
| 0.890000000000002 | 2.208 | 4.875 | 10.765 | 0.453 | 0.205 |
| 0.892000000000002 | 2.216 | 4.91 | 10.881 | 0.451 | 0.204 |
| 0.894000000000002 | 2.224 | 4.945 | 10.998 | 0.45 | 0.202 |
| 0.896000000000002 | 2.232 | 4.981 | 11.117 | 0.448 | 0.201 |
| 0.898000000000002 | 2.24 | 5.017 | 11.237 | 0.446 | 0.199 |
| 0.900000000000002 | 2.248 | 5.053 | 11.359 | 0.445 | 0.198 |
| 0.902000000000002 | 2.256 | 5.09 | 11.482 | 0.443 | 0.196 |
| 0.904000000000002 | 2.264 | 5.127 | 11.607 | 0.442 | 0.195 |
| 0.906000000000002 | 2.272 | 5.164 | 11.734 | 0.44 | 0.194 |
| 0.908000000000002 | 2.281 | 5.201 | 11.863 | 0.438 | 0.192 |
| 0.910000000000002 | 2.289 | 5.239 | 11.993 | 0.437 | 0.191 |
| 0.912000000000002 | 2.297 | 5.278 | 12.125 | 0.435 | 0.189 |
| 0.914000000000002 | 2.306 | 5.316 | 12.258 | 0.434 | 0.188 |
| 0.916000000000002 | 2.314 | 5.355 | 12.393 | 0.432 | 0.187 |
| 0.918000000000002 | 2.323 | 5.395 | 12.531 | 0.431 | 0.185 |
| 0.920000000000002 | 2.331 | 5.435 | 12.67 | 0.429 | 0.184 |
| 0.922000000000002 | 2.34 | 5.475 | 12.81 | 0.427 | 0.183 |
| 0.924000000000002 | 2.348 | 5.515 | 12.953 | 0.426 | 0.181 |
| 0.926000000000002 | 2.357 | 5.556 | 13.098 | 0.424 | 0.18 |
| 0.928000000000002 | 2.366 | 5.598 | 13.244 | 0.423 | 0.179 |
| 0.930000000000002 | 2.375 | 5.64 | 13.393 | 0.421 | 0.177 |
| 0.932000000000002 | 2.384 | 5.682 | 13.543 | 0.42 | 0.176 |
| 0.934000000000002 | 2.393 | 5.724 | 13.696 | 0.418 | 0.175 |
| 0.936000000000002 | 2.402 | 5.767 | 13.85 | 0.416 | 0.173 |
| 0.938000000000002 | 2.411 | 5.811 | 14.007 | 0.415 | 0.172 |
| 0.940000000000002 | 2.42 | 5.854 | 14.165 | 0.413 | 0.171 |
| 0.942000000000002 | 2.429 | 5.899 | 14.326 | 0.412 | 0.17 |
| 0.944000000000002 | 2.438 | 5.943 | 14.489 | 0.41 | 0.168 |
| 0.946000000000002 | 2.447 | 5.988 | 14.655 | 0.409 | 0.167 |
| 0.948000000000002 | 2.456 | 6.034 | 14.822 | 0.407 | 0.166 |
| 0.950000000000002 | 2.466 | 6.08 | 14.992 | 0.406 | 0.164 |
| 0.952000000000002 | 2.475 | 6.126 | 15.164 | 0.404 | 0.163 |
| 0.954000000000002 | 2.485 | 6.173 | 15.338 | 0.402 | 0.162 |
| 0.956000000000002 | 2.494 | 6.221 | 15.515 | 0.401 | 0.161 |
| 0.958000000000002 | 2.504 | 6.268 | 15.694 | 0.399 | 0.16 |
| 0.960000000000002 | 2.513 | 6.317 | 15.876 | 0.398 | 0.158 |
| 0.962000000000002 | 2.523 | 6.365 | 16.06 | 0.396 | 0.157 |
| 0.964000000000002 | 2.533 | 6.415 | 16.247 | 0.395 | 0.156 |
| 0.966000000000002 | 2.543 | 6.464 | 16.436 | 0.393 | 0.155 |
| 0.968000000000002 | 2.552 | 6.515 | 16.628 | 0.392 | 0.154 |
| 0.970000000000002 | 2.562 | 6.565 | 16.822 | 0.39 | 0.152 |
| 0.972000000000002 | 2.572 | 6.617 | 17.019 | 0.389 | 0.151 |
| 0.974000000000003 | 2.582 | 6.668 | 17.219 | 0.387 | 0.15 |
| 0.976000000000003 | 2.592 | 6.72 | 17.422 | 0.386 | 0.149 |
| 0.978000000000003 | 2.603 | 6.773 | 17.627 | 0.384 | 0.148 |
| 0.980000000000002 | 2.613 | 6.826 | 17.836 | 0.383 | 0.146 |
| 0.982000000000002 | 2.623 | 6.88 | 18.047 | 0.381 | 0.145 |
| 0.984000000000003 | 2.633 | 6.935 | 18.261 | 0.38 | 0.144 |
| 0.986000000000003 | 2.644 | 6.989 | 18.478 | 0.378 | 0.143 |
| 0.988000000000003 | 2.654 | 7.045 | 18.698 | 0.377 | 0.142 |
| 0.990000000000002 | 2.665 | 7.101 | 18.922 | 0.375 | 0.141 |
| 0.992000000000002 | 2.675 | 7.157 | 19.148 | 0.374 | 0.14 |
| 0.994000000000003 | 2.686 | 7.214 | 19.377 | 0.372 | 0.139 |
| 0.996000000000003 | 2.697 | 7.272 | 19.61 | 0.371 | 0.138 |
| 0.998000000000003 | 2.707 | 7.33 | 19.846 | 0.369 | 0.136 |
| 1.000000000000002 | 2.718 | 7.389 | 20.086 | 0.368 | 0.135 |
| 1.002000000000002 | 2.729 | 7.448 | 20.328 | 0.366 | 0.134 |
| 1.004000000000002 | 2.74 | 7.508 | 20.574 | 0.365 | 0.133 |
| 1.006000000000002 | 2.751 | 7.569 | 20.824 | 0.363 | 0.132 |
| 1.008000000000002 | 2.762 | 7.63 | 21.077 | 0.362 | 0.131 |
| 1.010000000000002 | 2.773 | 7.692 | 21.334 | 0.361 | 0.13 |
| 1.012000000000002 | 2.785 | 7.755 | 21.594 | 0.359 | 0.129 |
| 1.014000000000002 | 2.796 | 7.818 | 21.858 | 0.358 | 0.128 |
| 1.016000000000002 | 2.807 | 7.881 | 22.126 | 0.356 | 0.127 |
| 1.018000000000002 | 2.819 | 7.946 | 22.398 | 0.355 | 0.126 |
| 1.020000000000002 | 2.83 | 8.011 | 22.674 | 0.353 | 0.125 |
| 1.022000000000002 | 2.842 | 8.077 | 22.953 | 0.352 | 0.124 |
| 1.024000000000002 | 2.854 | 8.143 | 23.237 | 0.35 | 0.123 |
| 1.026000000000002 | 2.865 | 8.21 | 23.524 | 0.349 | 0.122 |
| 1.028000000000002 | 2.877 | 8.278 | 23.816 | 0.348 | 0.121 |
| 1.030000000000002 | 2.889 | 8.346 | 24.112 | 0.346 | 0.12 |
| 1.032000000000002 | 2.901 | 8.415 | 24.412 | 0.345 | 0.119 |
| 1.034000000000002 | 2.913 | 8.485 | 24.716 | 0.343 | 0.118 |
| 1.036000000000002 | 2.925 | 8.556 | 25.025 | 0.342 | 0.117 |
| 1.038000000000002 | 2.937 | 8.627 | 25.339 | 0.34 | 0.116 |
| 1.040000000000002 | 2.949 | 8.699 | 25.657 | 0.339 | 0.115 |
| 1.042000000000002 | 2.962 | 8.772 | 25.979 | 0.338 | 0.114 |
| 1.044000000000002 | 2.974 | 8.845 | 26.306 | 0.336 | 0.113 |
| 1.046000000000002 | 2.987 | 8.919 | 26.638 | 0.335 | 0.112 |
| 1.048000000000002 | 2.999 | 8.994 | 26.975 | 0.333 | 0.111 |
| 1.050000000000002 | 3.012 | 9.07 | 27.317 | 0.332 | 0.11 |
| 1.052000000000002 | 3.024 | 9.147 | 27.663 | 0.331 | 0.109 |
| 1.054000000000002 | 3.037 | 9.224 | 28.015 | 0.329 | 0.108 |
| 1.056000000000002 | 3.05 | 9.302 | 28.372 | 0.328 | 0.107 |
| 1.058000000000002 | 3.063 | 9.381 | 28.734 | 0.326 | 0.107 |
| 1.060000000000002 | 3.076 | 9.461 | 29.102 | 0.325 | 0.106 |
| 1.062000000000002 | 3.089 | 9.542 | 29.475 | 0.324 | 0.105 |
| 1.064000000000002 | 3.102 | 9.623 | 29.853 | 0.322 | 0.104 |
| 1.066000000000002 | 3.115 | 9.706 | 30.237 | 0.321 | 0.103 |
| 1.068000000000002 | 3.129 | 9.789 | 30.627 | 0.32 | 0.102 |
| 1.070000000000002 | 3.142 | 9.873 | 31.022 | 0.318 | 0.101 |
| 1.072000000000002 | 3.156 | 9.958 | 31.423 | 0.317 | 0.1 |
| 1.074000000000003 | 3.169 | 10.044 | 31.831 | 0.316 | 0.1 |
| 1.076000000000003 | 3.183 | 10.131 | 32.244 | 0.314 | 0.099 |
| 1.078000000000003 | 3.197 | 10.218 | 32.663 | 0.313 | 0.098 |
| 1.080000000000002 | 3.21 | 10.307 | 33.089 | 0.311 | 0.097 |
| 1.082000000000002 | 3.224 | 10.396 | 33.521 | 0.31 | 0.096 |
| 1.084000000000003 | 3.238 | 10.487 | 33.959 | 0.309 | 0.095 |
| 1.086000000000003 | 3.252 | 10.578 | 34.405 | 0.307 | 0.095 |
| 1.088000000000003 | 3.267 | 10.671 | 34.856 | 0.306 | 0.094 |
| 1.090000000000002 | 3.281 | 10.764 | 35.315 | 0.305 | 0.093 |
| 1.092000000000002 | 3.295 | 10.858 | 35.78 | 0.303 | 0.092 |
| 1.094000000000003 | 3.31 | 10.954 | 36.252 | 0.302 | 0.091 |
| 1.096000000000003 | 3.324 | 11.05 | 36.732 | 0.301 | 0.09 |
| 1.098000000000003 | 3.339 | 11.147 | 37.219 | 0.3 | 0.09 |
| 1.100000000000003 | 3.353 | 11.246 | 37.713 | 0.298 | 0.089 |
| 1.102000000000003 | 3.368 | 11.345 | 38.214 | 0.297 | 0.088 |
| 1.104000000000003 | 3.383 | 11.446 | 38.724 | 0.296 | 0.087 |
| 1.106000000000003 | 3.398 | 11.548 | 39.24 | 0.294 | 0.087 |
| 1.108000000000003 | 3.413 | 11.65 | 39.765 | 0.293 | 0.086 |
| 1.110000000000003 | 3.428 | 11.754 | 40.298 | 0.292 | 0.085 |
| 1.112000000000003 | 3.444 | 11.859 | 40.839 | 0.29 | 0.084 |
| 1.114000000000003 | 3.459 | 11.965 | 41.388 | 0.289 | 0.084 |
| 1.116000000000003 | 3.475 | 12.072 | 41.945 | 0.288 | 0.083 |
| 1.118000000000003 | 3.49 | 12.181 | 42.511 | 0.287 | 0.082 |
| 1.120000000000003 | 3.506 | 12.29 | 43.086 | 0.285 | 0.081 |
| 1.122000000000003 | 3.521 | 12.401 | 43.67 | 0.284 | 0.081 |
| 1.124000000000003 | 3.537 | 12.513 | 44.262 | 0.283 | 0.08 |
| 1.126000000000003 | 3.553 | 12.626 | 44.864 | 0.281 | 0.079 |
| 1.128000000000003 | 3.569 | 12.74 | 45.475 | 0.28 | 0.078 |
| 1.130000000000003 | 3.586 | 12.856 | 46.095 | 0.279 | 0.078 |
| 1.132000000000003 | 3.602 | 12.973 | 46.725 | 0.278 | 0.077 |
| 1.134000000000003 | 3.618 | 13.091 | 47.364 | 0.276 | 0.076 |
| 1.136000000000003 | 3.635 | 13.21 | 48.014 | 0.275 | 0.076 |
| 1.138000000000003 | 3.651 | 13.331 | 48.673 | 0.274 | 0.075 |
| 1.140000000000003 | 3.668 | 13.453 | 49.343 | 0.273 | 0.074 |
| 1.142000000000003 | 3.685 | 13.576 | 50.023 | 0.271 | 0.074 |
| 1.144000000000003 | 3.701 | 13.701 | 50.714 | 0.27 | 0.073 |
| 1.146000000000003 | 3.718 | 13.827 | 51.416 | 0.269 | 0.072 |
| 1.148000000000003 | 3.736 | 13.955 | 52.129 | 0.268 | 0.072 |
| 1.150000000000003 | 3.753 | 14.083 | 52.852 | 0.266 | 0.071 |
| 1.152000000000003 | 3.77 | 14.214 | 53.587 | 0.265 | 0.07 |
| 1.154000000000003 | 3.788 | 14.345 | 54.334 | 0.264 | 0.07 |
| 1.156000000000003 | 3.805 | 14.479 | 55.092 | 0.263 | 0.069 |
| 1.158000000000003 | 3.823 | 14.613 | 55.862 | 0.262 | 0.068 |
| 1.160000000000003 | 3.84 | 14.749 | 56.645 | 0.26 | 0.068 |
| 1.162000000000003 | 3.858 | 14.887 | 57.439 | 0.259 | 0.067 |
| 1.164000000000003 | 3.876 | 15.026 | 58.247 | 0.258 | 0.067 |
| 1.166000000000003 | 3.894 | 15.167 | 59.067 | 0.257 | 0.066 |
| 1.168000000000003 | 3.913 | 15.309 | 59.9 | 0.256 | 0.065 |
| 1.170000000000003 | 3.931 | 15.453 | 60.746 | 0.254 | 0.065 |
| 1.172000000000003 | 3.949 | 15.598 | 61.606 | 0.253 | 0.064 |
| 1.174000000000003 | 3.968 | 15.745 | 62.479 | 0.252 | 0.064 |
| 1.176000000000003 | 3.987 | 15.894 | 63.366 | 0.251 | 0.063 |
| 1.178000000000003 | 4.006 | 16.045 | 64.267 | 0.25 | 0.062 |
| 1.180000000000003 | 4.024 | 16.197 | 65.183 | 0.248 | 0.062 |
| 1.182000000000003 | 4.044 | 16.35 | 66.113 | 0.247 | 0.061 |
| 1.184000000000003 | 4.063 | 16.506 | 67.059 | 0.246 | 0.061 |
| 1.186000000000003 | 4.082 | 16.663 | 68.019 | 0.245 | 0.06 |
| 1.188000000000003 | 4.101 | 16.822 | 68.995 | 0.244 | 0.059 |
| 1.190000000000003 | 4.121 | 16.983 | 69.986 | 0.243 | 0.059 |
| 1.192000000000003 | 4.141 | 17.145 | 70.994 | 0.242 | 0.058 |
| 1.194000000000003 | 4.161 | 17.31 | 72.017 | 0.24 | 0.058 |
| 1.196000000000003 | 4.18 | 17.476 | 73.058 | 0.239 | 0.057 |
| 1.198000000000003 | 4.201 | 17.644 | 74.115 | 0.238 | 0.057 |
| 1.200000000000003 | 4.221 | 17.814 | 75.189 | 0.237 | 0.056 |
| 1.202000000000003 | 4.241 | 17.986 | 76.28 | 0.236 | 0.056 |
| 1.204000000000003 | 4.261 | 18.16 | 77.389 | 0.235 | 0.055 |
| 1.206000000000003 | 4.282 | 18.336 | 78.516 | 0.234 | 0.055 |
| 1.208000000000003 | 4.303 | 18.514 | 79.662 | 0.232 | 0.054 |
| 1.210000000000003 | 4.324 | 18.694 | 80.826 | 0.231 | 0.053 |
| 1.212000000000003 | 4.345 | 18.876 | 82.009 | 0.23 | 0.053 |
| 1.214000000000003 | 4.366 | 19.06 | 83.212 | 0.229 | 0.052 |
| 1.216000000000003 | 4.387 | 19.246 | 84.434 | 0.228 | 0.052 |
| 1.218000000000003 | 4.408 | 19.434 | 85.676 | 0.227 | 0.051 |
| 1.220000000000003 | 4.43 | 19.625 | 86.938 | 0.226 | 0.051 |
| 1.222000000000003 | 4.452 | 19.818 | 88.222 | 0.225 | 0.05 |
| 1.224000000000003 | 4.474 | 20.012 | 89.526 | 0.224 | 0.05 |
| 1.226000000000003 | 4.495 | 20.209 | 90.852 | 0.222 | 0.049 |
| 1.228000000000003 | 4.518 | 20.409 | 92.199 | 0.221 | 0.049 |
| 1.230000000000003 | 4.54 | 20.61 | 93.569 | 0.22 | 0.049 |
| 1.232000000000003 | 4.562 | 20.814 | 94.962 | 0.219 | 0.048 |
| 1.234000000000003 | 4.585 | 21.021 | 96.377 | 0.218 | 0.048 |
| 1.236000000000003 | 4.608 | 21.23 | 97.816 | 0.217 | 0.047 |
| 1.238000000000003 | 4.63 | 21.441 | 99.279 | 0.216 | 0.047 |
| 1.240000000000003 | 4.653 | 21.654 | 100.766 | 0.215 | 0.046 |
| 1.242000000000003 | 4.677 | 21.87 | 102.278 | 0.214 | 0.046 |
| 1.244000000000003 | 4.7 | 22.089 | 103.815 | 0.213 | 0.045 |
| 1.246000000000003 | 4.723 | 22.31 | 105.377 | 0.212 | 0.045 |
| 1.248000000000003 | 4.747 | 22.534 | 106.966 | 0.211 | 0.044 |
| 1.250000000000003 | 4.771 | 22.76 | 108.581 | 0.21 | 0.044 |
| 1.252000000000003 | 4.795 | 22.989 | 110.224 | 0.209 | 0.043 |
| 1.254000000000003 | 4.819 | 23.22 | 111.894 | 0.208 | 0.043 |
| 1.256000000000003 | 4.843 | 23.455 | 113.591 | 0.206 | 0.043 |
| 1.258000000000003 | 4.867 | 23.692 | 115.318 | 0.205 | 0.042 |
| 1.260000000000003 | 4.892 | 23.932 | 117.073 | 0.204 | 0.042 |
| 1.262000000000003 | 4.917 | 24.174 | 118.858 | 0.203 | 0.041 |
| 1.264000000000003 | 4.942 | 24.42 | 120.673 | 0.202 | 0.041 |
| 1.266000000000003 | 4.967 | 24.668 | 122.519 | 0.201 | 0.041 |
| 1.268000000000003 | 4.992 | 24.919 | 124.396 | 0.2 | 0.04 |
| 1.270000000000003 | 5.017 | 25.174 | 126.305 | 0.199 | 0.04 |
| 1.272000000000003 | 5.043 | 25.431 | 128.246 | 0.198 | 0.039 |
| 1.274000000000003 | 5.069 | 25.691 | 130.22 | 0.197 | 0.039 |
| 1.276000000000003 | 5.095 | 25.955 | 132.228 | 0.196 | 0.039 |
| 1.278000000000003 | 5.121 | 26.221 | 134.27 | 0.195 | 0.038 |
| 1.280000000000003 | 5.147 | 26.491 | 136.347 | 0.194 | 0.038 |
| 1.282000000000003 | 5.173 | 26.764 | 138.459 | 0.193 | 0.037 |
| 1.284000000000003 | 5.2 | 27.04 | 140.607 | 0.192 | 0.037 |
| 1.286000000000003 | 5.227 | 27.319 | 142.792 | 0.191 | 0.037 |
| 1.288000000000003 | 5.254 | 27.602 | 145.014 | 0.19 | 0.036 |
| 1.290000000000003 | 5.281 | 27.888 | 147.275 | 0.189 | 0.036 |
| 1.292000000000003 | 5.308 | 28.178 | 149.574 | 0.188 | 0.035 |
| 1.294000000000003 | 5.336 | 28.471 | 151.913 | 0.187 | 0.035 |
| 1.296000000000003 | 5.363 | 28.767 | 154.292 | 0.186 | 0.035 |
| 1.298000000000003 | 5.391 | 29.067 | 156.712 | 0.185 | 0.034 |
| 1.300000000000003 | 5.419 | 29.371 | 159.174 | 0.185 | 0.034 |
| 1.302000000000003 | 5.448 | 29.678 | 161.679 | 0.184 | 0.034 |
| 1.304000000000003 | 5.476 | 29.989 | 164.227 | 0.183 | 0.033 |
| 1.306000000000003 | 5.505 | 30.304 | 166.819 | 0.182 | 0.033 |
| 1.308000000000003 | 5.534 | 30.622 | 169.456 | 0.181 | 0.033 |
| 1.310000000000003 | 5.563 | 30.945 | 172.139 | 0.18 | 0.032 |
| 1.312000000000003 | 5.592 | 31.271 | 174.868 | 0.179 | 0.032 |
| 1.314000000000003 | 5.621 | 31.601 | 177.645 | 0.178 | 0.032 |
| 1.316000000000003 | 5.651 | 31.935 | 180.471 | 0.177 | 0.031 |
| 1.318000000000003 | 5.681 | 32.274 | 183.345 | 0.176 | 0.031 |
| 1.320000000000003 | 5.711 | 32.616 | 186.271 | 0.175 | 0.031 |
| 1.322000000000003 | 5.741 | 32.962 | 189.247 | 0.174 | 0.03 |
| 1.324000000000003 | 5.772 | 33.313 | 192.275 | 0.173 | 0.03 |
| 1.326000000000003 | 5.802 | 33.668 | 195.357 | 0.172 | 0.03 |
| 1.328000000000003 | 5.833 | 34.027 | 198.493 | 0.171 | 0.029 |
| 1.330000000000003 | 5.864 | 34.391 | 201.684 | 0.171 | 0.029 |
| 1.332000000000003 | 5.896 | 34.759 | 204.931 | 0.17 | 0.029 |
| 1.334000000000003 | 5.927 | 35.132 | 208.235 | 0.169 | 0.028 |
| 1.336000000000003 | 5.959 | 35.509 | 211.598 | 0.168 | 0.028 |
| 1.338000000000003 | 5.991 | 35.891 | 215.02 | 0.167 | 0.028 |
| 1.340000000000003 | 6.023 | 36.278 | 218.503 | 0.166 | 0.028 |
| 1.342000000000003 | 6.055 | 36.669 | 222.048 | 0.165 | 0.027 |
| 1.344000000000003 | 6.088 | 37.065 | 225.655 | 0.164 | 0.027 |
| 1.346000000000003 | 6.121 | 37.466 | 229.327 | 0.163 | 0.027 |
| 1.348000000000003 | 6.154 | 37.872 | 233.064 | 0.162 | 0.026 |
| 1.350000000000003 | 6.187 | 38.283 | 236.867 | 0.162 | 0.026 |
| 1.352000000000003 | 6.221 | 38.699 | 240.739 | 0.161 | 0.026 |
| 1.354000000000003 | 6.255 | 39.12 | 244.679 | 0.16 | 0.026 |
| 1.356000000000003 | 6.289 | 39.546 | 248.69 | 0.159 | 0.025 |
| 1.358000000000003 | 6.323 | 39.978 | 252.773 | 0.158 | 0.025 |
| 1.360000000000003 | 6.357 | 40.415 | 256.929 | 0.157 | 0.025 |
| 1.362000000000003 | 6.392 | 40.857 | 261.16 | 0.156 | 0.024 |
| 1.364000000000003 | 6.427 | 41.305 | 265.466 | 0.156 | 0.024 |
| 1.366000000000003 | 6.462 | 41.759 | 269.85 | 0.155 | 0.024 |
| 1.368000000000003 | 6.498 | 42.218 | 274.314 | 0.154 | 0.024 |
| 1.370000000000003 | 6.533 | 42.683 | 278.857 | 0.153 | 0.023 |
| 1.372000000000003 | 6.569 | 43.154 | 283.483 | 0.152 | 0.023 |
| 1.374000000000003 | 6.605 | 43.63 | 288.192 | 0.151 | 0.023 |
| 1.376000000000003 | 6.642 | 44.113 | 292.987 | 0.151 | 0.023 |
| 1.378000000000003 | 6.678 | 44.602 | 297.868 | 0.15 | 0.022 |
| 1.380000000000003 | 6.715 | 45.096 | 302.839 | 0.149 | 0.022 |
| 1.382000000000003 | 6.753 | 45.597 | 307.899 | 0.148 | 0.022 |
| 1.384000000000003 | 6.79 | 46.105 | 313.052 | 0.147 | 0.022 |
| 1.386000000000003 | 6.828 | 46.618 | 318.298 | 0.146 | 0.021 |
| 1.388000000000003 | 6.866 | 47.138 | 323.64 | 0.146 | 0.021 |
| 1.390000000000003 | 6.904 | 47.665 | 329.08 | 0.145 | 0.021 |
| 1.392000000000003 | 6.943 | 48.199 | 334.619 | 0.144 | 0.021 |
| 1.394000000000003 | 6.981 | 48.739 | 340.259 | 0.143 | 0.021 |
| 1.396000000000003 | 7.02 | 49.286 | 346.003 | 0.142 | 0.02 |
| 1.398000000000003 | 7.06 | 49.84 | 351.852 | 0.142 | 0.02 |
| 1.400000000000003 | 7.099 | 50.4 | 357.809 | 0.141 | 0.02 |
| 1.402000000000003 | 7.139 | 50.969 | 363.876 | 0.14 | 0.02 |
| 1.404000000000003 | 7.179 | 51.544 | 370.054 | 0.139 | 0.019 |
| 1.406000000000003 | 7.22 | 52.126 | 376.346 | 0.139 | 0.019 |
| 1.408000000000003 | 7.261 | 52.716 | 382.754 | 0.138 | 0.019 |
| 1.410000000000003 | 7.302 | 53.314 | 389.28 | 0.137 | 0.019 |
| 1.412000000000003 | 7.343 | 53.919 | 395.928 | 0.136 | 0.019 |
| 1.414000000000003 | 7.385 | 54.532 | 402.698 | 0.135 | 0.018 |
| 1.416000000000003 | 7.427 | 55.153 | 409.595 | 0.135 | 0.018 |
| 1.418000000000003 | 7.469 | 55.782 | 416.619 | 0.134 | 0.018 |
| 1.420000000000003 | 7.511 | 56.419 | 423.774 | 0.133 | 0.018 |
| 1.422000000000003 | 7.554 | 57.064 | 431.062 | 0.132 | 0.018 |
| 1.424000000000003 | 7.597 | 57.717 | 438.486 | 0.132 | 0.017 |
| 1.426000000000003 | 7.641 | 58.379 | 446.049 | 0.131 | 0.017 |
| 1.428000000000003 | 7.684 | 59.049 | 453.753 | 0.13 | 0.017 |
| 1.430000000000003 | 7.728 | 59.728 | 461.601 | 0.129 | 0.017 |
| 1.432000000000003 | 7.773 | 60.416 | 469.596 | 0.129 | 0.017 |
| 1.434000000000003 | 7.817 | 61.112 | 477.741 | 0.128 | 0.016 |
| 1.436000000000003 | 7.862 | 61.818 | 486.039 | 0.127 | 0.016 |
| 1.438000000000003 | 7.908 | 62.533 | 494.493 | 0.126 | 0.016 |
| 1.440000000000003 | 7.953 | 63.257 | 503.106 | 0.126 | 0.016 |
| 1.442000000000003 | 7.999 | 63.99 | 511.881 | 0.125 | 0.016 |
| 1.444000000000003 | 8.046 | 64.733 | 520.822 | 0.124 | 0.015 |
| 1.446000000000003 | 8.092 | 65.486 | 529.932 | 0.124 | 0.015 |
| 1.448000000000003 | 8.139 | 66.248 | 539.214 | 0.123 | 0.015 |
| 1.450000000000003 | 8.187 | 67.021 | 548.672 | 0.122 | 0.015 |
| 1.452000000000003 | 8.234 | 67.803 | 558.309 | 0.121 | 0.015 |
| 1.454000000000003 | 8.282 | 68.596 | 568.129 | 0.121 | 0.015 |
| 1.456000000000003 | 8.331 | 69.399 | 578.135 | 0.12 | 0.014 |
| 1.458000000000003 | 8.379 | 70.213 | 588.332 | 0.119 | 0.014 |
| 1.460000000000003 | 8.428 | 71.037 | 598.724 | 0.119 | 0.014 |
| 1.462000000000003 | 8.478 | 71.872 | 609.313 | 0.118 | 0.014 |
| 1.464000000000003 | 8.527 | 72.718 | 620.104 | 0.117 | 0.014 |
| 1.466000000000003 | 8.578 | 73.575 | 631.102 | 0.117 | 0.014 |
| 1.468000000000003 | 8.628 | 74.444 | 642.311 | 0.116 | 0.013 |
| 1.470000000000003 | 8.679 | 75.324 | 653.734 | 0.115 | 0.013 |
| 1.472000000000003 | 8.73 | 76.216 | 665.376 | 0.115 | 0.013 |
| 1.474000000000003 | 8.782 | 77.119 | 677.242 | 0.114 | 0.013 |
| 1.476000000000003 | 8.834 | 78.035 | 689.335 | 0.113 | 0.013 |
| 1.478000000000003 | 8.886 | 78.962 | 701.662 | 0.113 | 0.013 |
| 1.480000000000003 | 8.939 | 79.902 | 714.226 | 0.112 | 0.013 |
| 1.482000000000003 | 8.992 | 80.854 | 727.033 | 0.111 | 0.012 |
| 1.484000000000003 | 9.045 | 81.819 | 740.087 | 0.111 | 0.012 |
| 1.486000000000003 | 9.099 | 82.797 | 753.394 | 0.11 | 0.012 |
| 1.488000000000003 | 9.154 | 83.788 | 766.958 | 0.109 | 0.012 |
| 1.490000000000003 | 9.208 | 84.792 | 780.785 | 0.109 | 0.012 |
| 1.492000000000003 | 9.263 | 85.809 | 794.881 | 0.108 | 0.012 |
| 1.494000000000003 | 9.319 | 86.84 | 809.25 | 0.107 | 0.012 |
| 1.496000000000003 | 9.375 | 87.885 | 823.899 | 0.107 | 0.011 |
| 1.498000000000003 | 9.431 | 88.944 | 838.833 | 0.106 | 0.011 |
| 1.500000000000003 | 9.488 | 90.017 | 854.059 | 0.105 | 0.011 |
| 1.502000000000003 | 9.545 | 91.105 | 869.581 | 0.105 | 0.011 |
| 1.504000000000003 | 9.602 | 92.207 | 885.408 | 0.104 | 0.011 |
| 1.506000000000003 | 9.66 | 93.324 | 901.543 | 0.104 | 0.011 |
| 1.508000000000003 | 9.719 | 94.455 | 917.995 | 0.103 | 0.011 |
| 1.510000000000003 | 9.778 | 95.603 | 934.77 | 0.102 | 0.01 |
| 1.512000000000003 | 9.837 | 96.765 | 951.873 | 0.102 | 0.01 |
| 1.514000000000003 | 9.897 | 97.944 | 969.313 | 0.101 | 0.01 |
| 1.516000000000003 | 9.957 | 99.138 | 987.097 | 0.1 | 0.01 |
| 1.518000000000003 | 10.017 | 100.348 | 1005.23 | 0.1 | 0.01 |
| 1.520000000000003 | 10.078 | 101.575 | 1023.722 | 0.099 | 0.01 |
| 1.522000000000003 | 10.14 | 102.819 | 1042.578 | 0.099 | 0.01 |
| 1.524000000000003 | 10.202 | 104.079 | 1061.808 | 0.098 | 0.01 |
| 1.526000000000003 | 10.264 | 105.357 | 1081.418 | 0.097 | 0.009 |
| 1.528000000000003 | 10.327 | 106.652 | 1101.416 | 0.097 | 0.009 |
| 1.530000000000003 | 10.391 | 107.964 | 1121.811 | 0.096 | 0.009 |
| 1.532000000000003 | 10.454 | 109.295 | 1142.612 | 0.096 | 0.009 |
| 1.534000000000003 | 10.519 | 110.643 | 1163.826 | 0.095 | 0.009 |
| 1.536000000000003 | 10.583 | 112.01 | 1185.462 | 0.094 | 0.009 |
| 1.538000000000003 | 10.649 | 113.396 | 1207.53 | 0.094 | 0.009 |
| 1.540000000000003 | 10.715 | 114.801 | 1230.038 | 0.093 | 0.009 |
| 1.542000000000003 | 10.781 | 116.225 | 1252.995 | 0.093 | 0.009 |
| 1.544000000000003 | 10.848 | 117.669 | 1276.412 | 0.092 | 0.008 |
| 1.546000000000003 | 10.915 | 119.132 | 1300.297 | 0.092 | 0.008 |
| 1.548000000000003 | 10.983 | 120.616 | 1324.661 | 0.091 | 0.008 |
| 1.550000000000003 | 11.051 | 122.119 | 1349.514 | 0.09 | 0.008 |
| 1.552000000000003 | 11.12 | 123.644 | 1374.867 | 0.09 | 0.008 |
| 1.554000000000003 | 11.189 | 125.19 | 1400.729 | 0.089 | 0.008 |
| 1.556000000000003 | 11.259 | 126.757 | 1427.112 | 0.089 | 0.008 |
| 1.558000000000003 | 11.329 | 128.346 | 1454.027 | 0.088 | 0.008 |
| 1.560000000000003 | 11.4 | 129.957 | 1481.485 | 0.088 | 0.008 |
| 1.562000000000003 | 11.471 | 131.59 | 1509.497 | 0.087 | 0.008 |
| 1.564000000000003 | 11.543 | 133.245 | 1538.077 | 0.087 | 0.008 |
| 1.566000000000003 | 11.616 | 134.924 | 1567.235 | 0.086 | 0.007 |
| 1.568000000000003 | 11.689 | 136.626 | 1596.984 | 0.086 | 0.007 |
| 1.570000000000003 | 11.762 | 138.352 | 1627.337 | 0.085 | 0.007 |
| 1.572000000000003 | 11.836 | 140.102 | 1658.306 | 0.084 | 0.007 |
| 1.574000000000003 | 11.911 | 141.876 | 1689.906 | 0.084 | 0.007 |
| 1.576000000000003 | 11.986 | 143.675 | 1722.149 | 0.083 | 0.007 |
| 1.578000000000003 | 12.062 | 145.499 | 1755.049 | 0.083 | 0.007 |
| 1.580000000000003 | 12.139 | 147.348 | 1788.621 | 0.082 | 0.007 |
| 1.582000000000003 | 12.216 | 149.224 | 1822.878 | 0.082 | 0.007 |
| 1.584000000000003 | 12.293 | 151.126 | 1857.837 | 0.081 | 0.007 |
| 1.586000000000003 | 12.372 | 153.054 | 1893.511 | 0.081 | 0.007 |
| 1.588000000000003 | 12.45 | 155.01 | 1929.916 | 0.08 | 0.006 |
| 1.590000000000003 | 12.53 | 156.993 | 1967.069 | 0.08 | 0.006 |
| 1.592000000000003 | 12.61 | 159.004 | 2004.985 | 0.079 | 0.006 |
| 1.594000000000003 | 12.69 | 161.043 | 2043.681 | 0.079 | 0.006 |
| 1.596000000000003 | 12.771 | 163.111 | 2083.174 | 0.078 | 0.006 |
| 1.598000000000003 | 12.853 | 165.208 | 2123.481 | 0.078 | 0.006 |
| 1.600000000000003 | 12.936 | 167.335 | 2164.62 | 0.077 | 0.006 |
| 1.602000000000003 | 13.019 | 169.492 | 2206.608 | 0.077 | 0.006 |
| 1.604000000000003 | 13.103 | 171.68 | 2249.466 | 0.076 | 0.006 |
| 1.606000000000003 | 13.187 | 173.899 | 2293.21 | 0.076 | 0.006 |
| 1.608000000000003 | 13.272 | 176.149 | 2337.862 | 0.075 | 0.006 |
| 1.610000000000003 | 13.358 | 178.431 | 2383.44 | 0.075 | 0.006 |
| 1.612000000000003 | 13.444 | 180.745 | 2429.965 | 0.074 | 0.006 |
| 1.614000000000003 | 13.531 | 183.093 | 2477.457 | 0.074 | 0.005 |
| 1.616000000000003 | 13.619 | 185.473 | 2525.939 | 0.073 | 0.005 |
| 1.618000000000003 | 13.707 | 187.888 | 2575.431 | 0.073 | 0.005 |
| 1.620000000000003 | 13.796 | 190.338 | 2625.955 | 0.072 | 0.005 |
| 1.622000000000003 | 13.886 | 192.822 | 2677.535 | 0.072 | 0.005 |
| 1.624000000000003 | 13.976 | 195.342 | 2730.194 | 0.072 | 0.005 |
| 1.626000000000003 | 14.068 | 197.898 | 2783.955 | 0.071 | 0.005 |
| 1.628000000000003 | 14.159 | 200.491 | 2838.843 | 0.071 | 0.005 |
| 1.630000000000003 | 14.252 | 203.121 | 2894.883 | 0.07 | 0.005 |
| 1.632000000000003 | 14.345 | 205.788 | 2952.1 | 0.07 | 0.005 |
| 1.634000000000003 | 14.439 | 208.494 | 3010.52 | 0.069 | 0.005 |
| 1.636000000000003 | 14.534 | 211.239 | 3070.169 | 0.069 | 0.005 |
| 1.638000000000003 | 14.63 | 214.024 | 3131.076 | 0.068 | 0.005 |
| 1.640000000000003 | 14.726 | 216.849 | 3193.268 | 0.068 | 0.005 |
| 1.642000000000003 | 14.823 | 219.714 | 3256.773 | 0.067 | 0.005 |
| 1.644000000000003 | 14.92 | 222.621 | 3321.62 | 0.067 | 0.004 |
| 1.646000000000003 | 15.019 | 225.57 | 3387.841 | 0.067 | 0.004 |
| 1.648000000000003 | 15.118 | 228.562 | 3455.464 | 0.066 | 0.004 |
| 1.650000000000003 | 15.218 | 231.597 | 3524.522 | 0.066 | 0.004 |
| 1.652000000000003 | 15.319 | 234.677 | 3595.046 | 0.065 | 0.004 |
| 1.654000000000003 | 15.421 | 237.8 | 3667.069 | 0.065 | 0.004 |
| 1.656000000000003 | 15.523 | 240.97 | 3740.625 | 0.064 | 0.004 |
| 1.658000000000003 | 15.626 | 244.185 | 3815.748 | 0.064 | 0.004 |
| 1.660000000000003 | 15.73 | 247.448 | 3892.473 | 0.064 | 0.004 |
| 1.662000000000003 | 15.835 | 250.758 | 3970.836 | 0.063 | 0.004 |
| 1.664000000000003 | 15.941 | 254.116 | 4050.874 | 0.063 | 0.004 |
| 1.666000000000003 | 16.048 | 257.524 | 4132.625 | 0.062 | 0.004 |
| 1.668000000000003 | 16.155 | 260.981 | 4216.126 | 0.062 | 0.004 |
| 1.670000000000003 | 16.263 | 264.489 | 4301.418 | 0.061 | 0.004 |
| 1.672000000000003 | 16.372 | 268.049 | 4388.541 | 0.061 | 0.004 |
| 1.674000000000003 | 16.482 | 271.66 | 4477.535 | 0.061 | 0.004 |
| 1.676000000000003 | 16.593 | 275.325 | 4568.444 | 0.06 | 0.004 |
| 1.678000000000003 | 16.705 | 279.044 | 4661.311 | 0.06 | 0.004 |
| 1.680000000000003 | 16.817 | 282.817 | 4756.18 | 0.059 | 0.004 |
| 1.682000000000003 | 16.931 | 286.646 | 4853.095 | 0.059 | 0.003 |
| 1.684000000000003 | 17.045 | 290.531 | 4952.105 | 0.059 | 0.003 |
| 1.686000000000003 | 17.16 | 294.474 | 5053.256 | 0.058 | 0.003 |
| 1.688000000000003 | 17.276 | 298.476 | 5156.596 | 0.058 | 0.003 |
| 1.690000000000003 | 17.394 | 302.536 | 5262.176 | 0.057 | 0.003 |
| 1.692000000000003 | 17.512 | 306.656 | 5370.047 | 0.057 | 0.003 |
| 1.694000000000003 | 17.631 | 310.838 | 5480.261 | 0.057 | 0.003 |
| 1.696000000000003 | 17.751 | 315.082 | 5592.871 | 0.056 | 0.003 |
| 1.698000000000003 | 17.871 | 319.388 | 5707.932 | 0.056 | 0.003 |
| 1.700000000000003 | 17.993 | 323.759 | 5825.499 | 0.056 | 0.003 |
| 1.702000000000003 | 18.116 | 328.195 | 5945.631 | 0.055 | 0.003 |
| 1.704000000000003 | 18.24 | 332.697 | 6068.386 | 0.055 | 0.003 |
| 1.706000000000003 | 18.365 | 337.266 | 6193.824 | 0.054 | 0.003 |
| 1.708000000000003 | 18.491 | 341.903 | 6322.007 | 0.054 | 0.003 |
| 1.710000000000003 | 18.617 | 346.61 | 6452.997 | 0.054 | 0.003 |
| 1.712000000000003 | 18.745 | 351.387 | 6586.86 | 0.053 | 0.003 |
| 1.714000000000003 | 18.874 | 356.235 | 6723.66 | 0.053 | 0.003 |
| 1.716000000000003 | 19.004 | 361.157 | 6863.467 | 0.053 | 0.003 |
| 1.718000000000003 | 19.135 | 366.152 | 7006.349 | 0.052 | 0.003 |
| 1.720000000000003 | 19.267 | 371.222 | 7152.377 | 0.052 | 0.003 |
| 1.722000000000003 | 19.4 | 376.368 | 7301.624 | 0.052 | 0.003 |
| 1.724000000000003 | 19.534 | 381.592 | 7454.163 | 0.051 | 0.003 |
| 1.726000000000003 | 19.67 | 386.894 | 7610.073 | 0.051 | 0.003 |
| 1.728000000000003 | 19.806 | 392.277 | 7769.429 | 0.05 | 0.003 |
| 1.730000000000003 | 19.943 | 397.741 | 7932.313 | 0.05 | 0.003 |
| 1.732000000000003 | 20.082 | 403.287 | 8098.807 | 0.05 | 0.002 |
| 1.734000000000003 | 20.222 | 408.917 | 8268.993 | 0.049 | 0.002 |
| 1.736000000000003 | 20.363 | 414.632 | 8442.958 | 0.049 | 0.002 |
| 1.738000000000003 | 20.504 | 420.434 | 8620.79 | 0.049 | 0.002 |
| 1.740000000000003 | 20.648 | 426.324 | 8802.579 | 0.048 | 0.002 |
| 1.742000000000003 | 20.792 | 432.304 | 8988.417 | 0.048 | 0.002 |
| 1.744000000000003 | 20.937 | 438.374 | 9178.398 | 0.048 | 0.002 |
| 1.746000000000003 | 21.084 | 444.536 | 9372.62 | 0.047 | 0.002 |
| 1.748000000000003 | 21.232 | 450.793 | 9571.182 | 0.047 | 0.002 |
| 1.750000000000003 | 21.381 | 457.145 | 9774.185 | 0.047 | 0.002 |
| 1.752000000000003 | 21.531 | 463.593 | 9981.733 | 0.046 | 0.002 |
| 1.754000000000003 | 21.683 | 470.141 | 10193.933 | 0.046 | 0.002 |
| 1.756000000000003 | 21.835 | 476.788 | 10410.894 | 0.046 | 0.002 |
| 1.758000000000003 | 21.989 | 483.537 | 10632.727 | 0.045 | 0.002 |
| 1.760000000000003 | 22.145 | 490.39 | 10859.548 | 0.045 | 0.002 |
| 1.762000000000003 | 22.301 | 497.347 | 11091.474 | 0.045 | 0.002 |
| 1.764000000000003 | 22.459 | 504.411 | 11328.625 | 0.045 | 0.002 |
| 1.766000000000003 | 22.618 | 511.584 | 11571.124 | 0.044 | 0.002 |
| 1.768000000000003 | 22.779 | 518.867 | 11819.098 | 0.044 | 0.002 |
| 1.770000000000003 | 22.94 | 526.262 | 12072.676 | 0.044 | 0.002 |
| 1.772000000000003 | 23.103 | 533.772 | 12331.99 | 0.043 | 0.002 |
| 1.774000000000003 | 23.268 | 541.397 | 12597.177 | 0.043 | 0.002 |
| 1.776000000000003 | 23.434 | 549.139 | 12868.375 | 0.043 | 0.002 |
| 1.778000000000003 | 23.601 | 557.002 | 13145.726 | 0.042 | 0.002 |
| 1.780000000000003 | 23.769 | 564.985 | 13429.378 | 0.042 | 0.002 |
| 1.782000000000003 | 23.939 | 573.093 | 13719.48 | 0.042 | 0.002 |
| 1.784000000000003 | 24.111 | 581.326 | 14016.185 | 0.041 | 0.002 |
| 1.786000000000003 | 24.283 | 589.687 | 14319.65 | 0.041 | 0.002 |
| 1.788000000000003 | 24.458 | 598.178 | 14630.037 | 0.041 | 0.002 |
| 1.790000000000003 | 24.633 | 606.8 | 14947.51 | 0.041 | 0.002 |
| 1.792000000000003 | 24.81 | 615.557 | 15272.239 | 0.04 | 0.002 |
| 1.794000000000003 | 24.989 | 624.45 | 15604.397 | 0.04 | 0.002 |
| 1.796000000000003 | 25.169 | 633.482 | 15944.162 | 0.04 | 0.002 |
| 1.798000000000003 | 25.351 | 642.655 | 16291.715 | 0.039 | 0.002 |
| 1.800000000000003 | 25.534 | 651.971 | 16647.245 | 0.039 | 0.002 |
| 1.802000000000003 | 25.718 | 661.433 | 17010.941 | 0.039 | 0.002 |
| 1.804000000000003 | 25.904 | 671.042 | 17383 | 0.039 | 0.001 |
| 1.806000000000003 | 26.092 | 680.802 | 17763.623 | 0.038 | 0.001 |
| 1.808000000000003 | 26.281 | 690.715 | 18153.016 | 0.038 | 0.001 |
| 1.810000000000003 | 26.472 | 700.784 | 18551.39 | 0.038 | 0.001 |
| 1.812000000000003 | 26.665 | 711.011 | 18958.961 | 0.038 | 0.001 |
| 1.814000000000003 | 26.859 | 721.399 | 19375.952 | 0.037 | 0.001 |
| 1.816000000000003 | 27.055 | 731.95 | 19802.59 | 0.037 | 0.001 |
| 1.818000000000003 | 27.252 | 742.667 | 20239.107 | 0.037 | 0.001 |
| 1.820000000000003 | 27.451 | 753.553 | 20685.743 | 0.036 | 0.001 |
| 1.822000000000003 | 27.652 | 764.612 | 21142.743 | 0.036 | 0.001 |
| 1.824000000000003 | 27.854 | 775.844 | 21610.358 | 0.036 | 0.001 |
| 1.826000000000003 | 28.058 | 787.255 | 22088.845 | 0.036 | 0.001 |
| 1.828000000000003 | 28.264 | 798.846 | 22578.468 | 0.035 | 0.001 |
| 1.830000000000003 | 28.471 | 810.62 | 23079.499 | 0.035 | 0.001 |
| 1.832000000000003 | 28.681 | 822.582 | 23592.213 | 0.035 | 0.001 |
| 1.834000000000003 | 28.892 | 834.733 | 24116.897 | 0.035 | 0.001 |
| 1.836000000000003 | 29.105 | 847.077 | 24653.841 | 0.034 | 0.001 |
| 1.838000000000003 | 29.319 | 859.618 | 25203.345 | 0.034 | 0.001 |
| 1.840000000000003 | 29.536 | 872.358 | 25765.715 | 0.034 | 0.001 |
| 1.842000000000003 | 29.754 | 885.301 | 26341.265 | 0.034 | 0.001 |
| 1.844000000000003 | 29.974 | 898.451 | 26930.318 | 0.033 | 0.001 |
| 1.846000000000003 | 30.196 | 911.81 | 27533.205 | 0.033 | 0.001 |
| 1.848000000000003 | 30.42 | 925.383 | 28150.264 | 0.033 | 0.001 |
| 1.850000000000003 | 30.646 | 939.173 | 28781.843 | 0.033 | 0.001 |
| 1.852000000000003 | 30.874 | 953.184 | 29428.298 | 0.032 | 0.001 |
| 1.854000000000003 | 31.103 | 967.419 | 30089.995 | 0.032 | 0.001 |
| 1.856000000000003 | 31.335 | 981.883 | 30767.309 | 0.032 | 0.001 |
| 1.858000000000003 | 31.569 | 996.579 | 31460.624 | 0.032 | 0.001 |
| 1.860000000000003 | 31.804 | 1011.51 | 32170.334 | 0.031 | 0.001 |
| 1.862000000000003 | 32.042 | 1026.682 | 32896.844 | 0.031 | 0.001 |
| 1.864000000000003 | 32.282 | 1042.099 | 33640.568 | 0.031 | 0.001 |
| 1.866000000000003 | 32.523 | 1057.763 | 34401.932 | 0.031 | 0.001 |
| 1.868000000000003 | 32.767 | 1073.681 | 35181.371 | 0.031 | 0.001 |
| 1.870000000000003 | 33.013 | 1089.855 | 35979.334 | 0.03 | 0.001 |
| 1.872000000000003 | 33.261 | 1106.291 | 36796.279 | 0.03 | 0.001 |
| 1.874000000000003 | 33.511 | 1122.992 | 37632.676 | 0.03 | 0.001 |
| 1.876000000000003 | 33.763 | 1139.964 | 38489.009 | 0.03 | 0.001 |
| 1.878000000000003 | 34.018 | 1157.211 | 39365.773 | 0.029 | 0.001 |
| 1.880000000000003 | 34.274 | 1174.738 | 40263.475 | 0.029 | 0.001 |
| 1.882000000000003 | 34.533 | 1192.549 | 41182.636 | 0.029 | 0.001 |
| 1.884000000000003 | 34.794 | 1210.649 | 42123.792 | 0.029 | 0.001 |
| 1.886000000000003 | 35.058 | 1229.044 | 43087.491 | 0.029 | 0.001 |
| 1.888000000000003 | 35.323 | 1247.739 | 44074.294 | 0.028 | 0.001 |
| 1.890000000000003 | 35.591 | 1266.738 | 45084.78 | 0.028 | 0.001 |
| 1.892000000000003 | 35.861 | 1286.046 | 46119.54 | 0.028 | 0.001 |
| 1.894000000000003 | 36.134 | 1305.671 | 47179.181 | 0.028 | 0.001 |
| 1.896000000000003 | 36.409 | 1325.615 | 48264.327 | 0.027 | 0.001 |
| 1.898000000000003 | 36.686 | 1345.886 | 49375.617 | 0.027 | 0.001 |
| 1.900000000000003 | 36.966 | 1366.489 | 50513.707 | 0.027 | 0.001 |
| 1.902000000000003 | 37.248 | 1387.429 | 51679.269 | 0.027 | 0.001 |
| 1.904000000000003 | 37.533 | 1408.713 | 52872.995 | 0.027 | 0.001 |
| 1.906000000000003 | 37.82 | 1430.346 | 54095.593 | 0.026 | 0.001 |
| 1.908000000000003 | 38.11 | 1452.335 | 55347.789 | 0.026 | 0.001 |
| 1.910000000000003 | 38.402 | 1474.685 | 56630.331 | 0.026 | 0.001 |
| 1.912000000000003 | 38.696 | 1497.404 | 57943.982 | 0.026 | 0.001 |
| 1.914000000000003 | 38.994 | 1520.496 | 59289.529 | 0.026 | 0.001 |
| 1.916000000000003 | 39.293 | 1543.97 | 60667.778 | 0.025 | 0.001 |
| 1.918000000000003 | 39.596 | 1567.83 | 62079.556 | 0.025 | 0.001 |
| 1.920000000000003 | 39.901 | 1592.085 | 63525.711 | 0.025 | 0.001 |
| 1.922000000000003 | 40.209 | 1616.742 | 65007.115 | 0.025 | 0.001 |
| 1.924000000000003 | 40.519 | 1641.806 | 66524.661 | 0.025 | 0.001 |
| 1.926000000000003 | 40.832 | 1667.285 | 68079.267 | 0.024 | 0.001 |
| 1.928000000000003 | 41.148 | 1693.187 | 69671.875 | 0.024 | 0.001 |
| 1.930000000000003 | 41.467 | 1719.519 | 71303.451 | 0.024 | 0.001 |
| 1.932000000000003 | 41.789 | 1746.289 | 72974.986 | 0.024 | 0.001 |
| 1.934000000000003 | 42.113 | 1773.503 | 74687.498 | 0.024 | 0.001 |
| 1.936000000000003 | 42.44 | 1801.17 | 76442.033 | 0.024 | 0.001 |
| 1.938000000000003 | 42.77 | 1829.299 | 78239.663 | 0.023 | 0.001 |
| 1.940000000000003 | 43.103 | 1857.896 | 80081.488 | 0.023 | 0.001 |
| 1.942000000000003 | 43.439 | 1886.971 | 81968.639 | 0.023 | 0.001 |
| 1.944000000000003 | 43.778 | 1916.531 | 83902.274 | 0.023 | 0.001 |
| 1.946000000000003 | 44.12 | 1946.585 | 85883.585 | 0.023 | 0.001 |
| 1.948000000000003 | 44.465 | 1977.143 | 87913.794 | 0.022 | 0.001 |
| 1.950000000000003 | 44.813 | 2008.212 | 89994.155 | 0.022 | 0 |
| 1.952000000000003 | 45.164 | 2039.802 | 92125.955 | 0.022 | 0 |
| 1.954000000000003 | 45.518 | 2071.922 | 94310.518 | 0.022 | 0 |
| 1.956000000000003 | 45.876 | 2104.582 | 96549.2 | 0.022 | 0 |
| 1.958000000000003 | 46.236 | 2137.79 | 98843.394 | 0.022 | 0 |
| 1.960000000000003 | 46.6 | 2171.558 | 101194.532 | 0.021 | 0 |
| 1.962000000000003 | 46.967 | 2205.894 | 103604.081 | 0.021 | 0 |
| 1.964000000000003 | 47.337 | 2240.808 | 106073.55 | 0.021 | 0 |
| 1.966000000000003 | 47.711 | 2276.312 | 108604.487 | 0.021 | 0 |
| 1.968000000000003 | 48.088 | 2312.416 | 111198.481 | 0.021 | 0 |
| 1.970000000000003 | 48.468 | 2349.129 | 113857.165 | 0.021 | 0 |
| 1.972000000000003 | 48.851 | 2386.464 | 116582.214 | 0.02 | 0 |
| 1.974000000000003 | 49.239 | 2424.431 | 119375.349 | 0.02 | 0 |
| 1.976000000000003 | 49.629 | 2463.041 | 122238.337 | 0.02 | 0 |
| 1.978000000000003 | 50.023 | 2502.306 | 125172.993 | 0.02 | 0 |
| 1.980000000000003 | 50.421 | 2542.238 | 128181.179 | 0.02 | 0 |
| 1.982000000000003 | 50.822 | 2582.848 | 131264.808 | 0.02 | 0 |
| 1.984000000000003 | 51.226 | 2624.149 | 134425.847 | 0.02 | 0 |
| 1.986000000000003 | 51.635 | 2666.153 | 137666.311 | 0.019 | 0 |
| 1.988000000000003 | 52.047 | 2708.873 | 140988.274 | 0.019 | 0 |
| 1.990000000000003 | 52.463 | 2752.321 | 144393.862 | 0.019 | 0 |
| 1.992000000000003 | 52.882 | 2796.511 | 147885.263 | 0.019 | 0 |
| 1.994000000000003 | 53.305 | 2841.456 | 151464.719 | 0.019 | 0 |
| 1.996000000000003 | 53.732 | 2887.17 | 155134.537 | 0.019 | 0 |
| 1.998000000000003 | 54.163 | 2933.666 | 158897.084 | 0.018 | 0 |
| 2.000000000000003 | 54.598 | 2980.958 | 162754.791 | 0.018 | 0 |